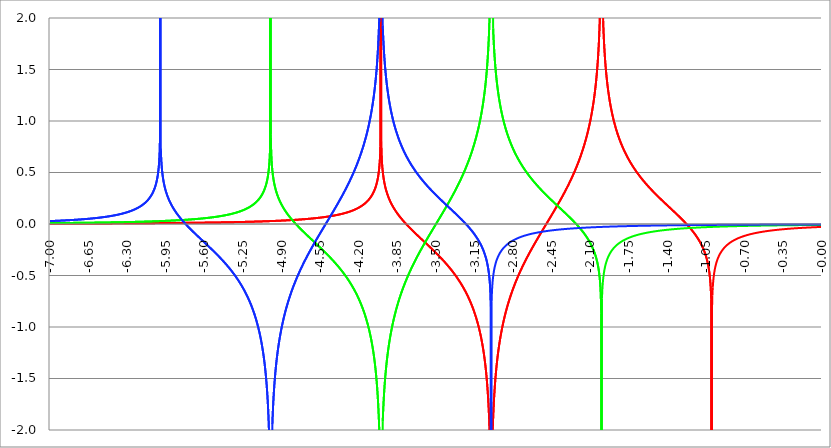
| Category | Series 1 | Series 0 | Series 2 |
|---|---|---|---|
| -7.0 | 0.004 | 0.009 | 0.028 |
| -6.9965 | 0.004 | 0.009 | 0.028 |
| -6.993 | 0.004 | 0.009 | 0.029 |
| -6.9895 | 0.004 | 0.009 | 0.029 |
| -6.986 | 0.004 | 0.009 | 0.029 |
| -6.982500000000001 | 0.004 | 0.009 | 0.029 |
| -6.979 | 0.004 | 0.009 | 0.029 |
| -6.975500000000001 | 0.004 | 0.009 | 0.029 |
| -6.972000000000001 | 0.004 | 0.009 | 0.03 |
| -6.968500000000001 | 0.004 | 0.009 | 0.03 |
| -6.965000000000002 | 0.004 | 0.009 | 0.03 |
| -6.961500000000002 | 0.004 | 0.009 | 0.03 |
| -6.958000000000002 | 0.004 | 0.009 | 0.03 |
| -6.954500000000002 | 0.004 | 0.009 | 0.03 |
| -6.951000000000002 | 0.004 | 0.009 | 0.03 |
| -6.947500000000002 | 0.004 | 0.009 | 0.031 |
| -6.944000000000003 | 0.004 | 0.009 | 0.031 |
| -6.940500000000003 | 0.004 | 0.009 | 0.031 |
| -6.937000000000003 | 0.004 | 0.009 | 0.031 |
| -6.933500000000003 | 0.004 | 0.009 | 0.031 |
| -6.930000000000003 | 0.004 | 0.009 | 0.031 |
| -6.926500000000003 | 0.004 | 0.01 | 0.032 |
| -6.923000000000004 | 0.004 | 0.01 | 0.032 |
| -6.919500000000004 | 0.004 | 0.01 | 0.032 |
| -6.916000000000004 | 0.004 | 0.01 | 0.032 |
| -6.912500000000004 | 0.004 | 0.01 | 0.032 |
| -6.909000000000004 | 0.004 | 0.01 | 0.033 |
| -6.905500000000004 | 0.004 | 0.01 | 0.033 |
| -6.902000000000004 | 0.004 | 0.01 | 0.033 |
| -6.898500000000005 | 0.004 | 0.01 | 0.033 |
| -6.895000000000005 | 0.004 | 0.01 | 0.033 |
| -6.891500000000005 | 0.004 | 0.01 | 0.033 |
| -6.888000000000005 | 0.004 | 0.01 | 0.034 |
| -6.884500000000005 | 0.004 | 0.01 | 0.034 |
| -6.881000000000005 | 0.004 | 0.01 | 0.034 |
| -6.877500000000006 | 0.004 | 0.01 | 0.034 |
| -6.874000000000006 | 0.004 | 0.01 | 0.034 |
| -6.870500000000006 | 0.004 | 0.01 | 0.035 |
| -6.867000000000006 | 0.004 | 0.01 | 0.035 |
| -6.863500000000006 | 0.004 | 0.01 | 0.035 |
| -6.860000000000006 | 0.004 | 0.01 | 0.035 |
| -6.856500000000007 | 0.004 | 0.01 | 0.035 |
| -6.853000000000007 | 0.004 | 0.01 | 0.036 |
| -6.849500000000007 | 0.004 | 0.01 | 0.036 |
| -6.846000000000007 | 0.004 | 0.01 | 0.036 |
| -6.842500000000007 | 0.004 | 0.01 | 0.036 |
| -6.839000000000007 | 0.004 | 0.01 | 0.036 |
| -6.835500000000008 | 0.004 | 0.01 | 0.037 |
| -6.832000000000008 | 0.004 | 0.01 | 0.037 |
| -6.828500000000008 | 0.004 | 0.01 | 0.037 |
| -6.825000000000008 | 0.004 | 0.011 | 0.037 |
| -6.821500000000008 | 0.004 | 0.011 | 0.037 |
| -6.818000000000008 | 0.005 | 0.011 | 0.038 |
| -6.814500000000009 | 0.005 | 0.011 | 0.038 |
| -6.811000000000009 | 0.005 | 0.011 | 0.038 |
| -6.807500000000009 | 0.005 | 0.011 | 0.038 |
| -6.804000000000009 | 0.005 | 0.011 | 0.039 |
| -6.800500000000009 | 0.005 | 0.011 | 0.039 |
| -6.797000000000009 | 0.005 | 0.011 | 0.039 |
| -6.79350000000001 | 0.005 | 0.011 | 0.039 |
| -6.79000000000001 | 0.005 | 0.011 | 0.039 |
| -6.78650000000001 | 0.005 | 0.011 | 0.04 |
| -6.78300000000001 | 0.005 | 0.011 | 0.04 |
| -6.77950000000001 | 0.005 | 0.011 | 0.04 |
| -6.77600000000001 | 0.005 | 0.011 | 0.04 |
| -6.772500000000011 | 0.005 | 0.011 | 0.041 |
| -6.769000000000011 | 0.005 | 0.011 | 0.041 |
| -6.765500000000011 | 0.005 | 0.011 | 0.041 |
| -6.762000000000011 | 0.005 | 0.011 | 0.041 |
| -6.758500000000011 | 0.005 | 0.011 | 0.042 |
| -6.755000000000011 | 0.005 | 0.011 | 0.042 |
| -6.751500000000012 | 0.005 | 0.011 | 0.042 |
| -6.748000000000012 | 0.005 | 0.011 | 0.042 |
| -6.744500000000012 | 0.005 | 0.011 | 0.043 |
| -6.741000000000012 | 0.005 | 0.011 | 0.043 |
| -6.737500000000012 | 0.005 | 0.011 | 0.043 |
| -6.734000000000012 | 0.005 | 0.012 | 0.043 |
| -6.730500000000013 | 0.005 | 0.012 | 0.044 |
| -6.727000000000013 | 0.005 | 0.012 | 0.044 |
| -6.723500000000013 | 0.005 | 0.012 | 0.044 |
| -6.720000000000013 | 0.005 | 0.012 | 0.045 |
| -6.716500000000013 | 0.005 | 0.012 | 0.045 |
| -6.713000000000013 | 0.005 | 0.012 | 0.045 |
| -6.709500000000013 | 0.005 | 0.012 | 0.045 |
| -6.706000000000014 | 0.005 | 0.012 | 0.046 |
| -6.702500000000014 | 0.005 | 0.012 | 0.046 |
| -6.699000000000014 | 0.005 | 0.012 | 0.046 |
| -6.695500000000014 | 0.005 | 0.012 | 0.047 |
| -6.692000000000014 | 0.005 | 0.012 | 0.047 |
| -6.688500000000014 | 0.005 | 0.012 | 0.047 |
| -6.685000000000015 | 0.005 | 0.012 | 0.047 |
| -6.681500000000015 | 0.005 | 0.012 | 0.048 |
| -6.678000000000015 | 0.005 | 0.012 | 0.048 |
| -6.674500000000015 | 0.005 | 0.012 | 0.048 |
| -6.671000000000015 | 0.005 | 0.012 | 0.049 |
| -6.667500000000015 | 0.005 | 0.012 | 0.049 |
| -6.664000000000016 | 0.005 | 0.012 | 0.049 |
| -6.660500000000016 | 0.005 | 0.012 | 0.05 |
| -6.657000000000016 | 0.005 | 0.013 | 0.05 |
| -6.653500000000016 | 0.005 | 0.013 | 0.05 |
| -6.650000000000016 | 0.005 | 0.013 | 0.051 |
| -6.646500000000016 | 0.005 | 0.013 | 0.051 |
| -6.643000000000017 | 0.005 | 0.013 | 0.051 |
| -6.639500000000017 | 0.005 | 0.013 | 0.052 |
| -6.636000000000017 | 0.005 | 0.013 | 0.052 |
| -6.632500000000017 | 0.005 | 0.013 | 0.052 |
| -6.629000000000017 | 0.005 | 0.013 | 0.053 |
| -6.625500000000017 | 0.005 | 0.013 | 0.053 |
| -6.622000000000018 | 0.005 | 0.013 | 0.054 |
| -6.618500000000018 | 0.005 | 0.013 | 0.054 |
| -6.615000000000018 | 0.005 | 0.013 | 0.054 |
| -6.611500000000018 | 0.005 | 0.013 | 0.055 |
| -6.608000000000018 | 0.005 | 0.013 | 0.055 |
| -6.604500000000018 | 0.005 | 0.013 | 0.055 |
| -6.601000000000019 | 0.005 | 0.013 | 0.056 |
| -6.597500000000019 | 0.005 | 0.013 | 0.056 |
| -6.594000000000019 | 0.005 | 0.013 | 0.057 |
| -6.590500000000019 | 0.005 | 0.013 | 0.057 |
| -6.587000000000019 | 0.005 | 0.013 | 0.057 |
| -6.583500000000019 | 0.005 | 0.014 | 0.058 |
| -6.58000000000002 | 0.005 | 0.014 | 0.058 |
| -6.57650000000002 | 0.005 | 0.014 | 0.059 |
| -6.57300000000002 | 0.005 | 0.014 | 0.059 |
| -6.56950000000002 | 0.005 | 0.014 | 0.059 |
| -6.56600000000002 | 0.005 | 0.014 | 0.06 |
| -6.56250000000002 | 0.005 | 0.014 | 0.06 |
| -6.55900000000002 | 0.005 | 0.014 | 0.061 |
| -6.555500000000021 | 0.006 | 0.014 | 0.061 |
| -6.552000000000021 | 0.006 | 0.014 | 0.062 |
| -6.548500000000021 | 0.006 | 0.014 | 0.062 |
| -6.545000000000021 | 0.006 | 0.014 | 0.063 |
| -6.541500000000021 | 0.006 | 0.014 | 0.063 |
| -6.538000000000021 | 0.006 | 0.014 | 0.063 |
| -6.534500000000022 | 0.006 | 0.014 | 0.064 |
| -6.531000000000021 | 0.006 | 0.014 | 0.064 |
| -6.527500000000022 | 0.006 | 0.014 | 0.065 |
| -6.524000000000022 | 0.006 | 0.014 | 0.065 |
| -6.520500000000022 | 0.006 | 0.015 | 0.066 |
| -6.517000000000023 | 0.006 | 0.015 | 0.066 |
| -6.513500000000023 | 0.006 | 0.015 | 0.067 |
| -6.510000000000023 | 0.006 | 0.015 | 0.067 |
| -6.506500000000023 | 0.006 | 0.015 | 0.068 |
| -6.503000000000023 | 0.006 | 0.015 | 0.068 |
| -6.499500000000023 | 0.006 | 0.015 | 0.069 |
| -6.496000000000023 | 0.006 | 0.015 | 0.07 |
| -6.492500000000024 | 0.006 | 0.015 | 0.07 |
| -6.489000000000023 | 0.006 | 0.015 | 0.071 |
| -6.485500000000024 | 0.006 | 0.015 | 0.071 |
| -6.482000000000024 | 0.006 | 0.015 | 0.072 |
| -6.478500000000024 | 0.006 | 0.015 | 0.072 |
| -6.475000000000024 | 0.006 | 0.015 | 0.073 |
| -6.471500000000024 | 0.006 | 0.015 | 0.073 |
| -6.468000000000024 | 0.006 | 0.015 | 0.074 |
| -6.464500000000025 | 0.006 | 0.015 | 0.075 |
| -6.461000000000025 | 0.006 | 0.016 | 0.075 |
| -6.457500000000025 | 0.006 | 0.016 | 0.076 |
| -6.454000000000025 | 0.006 | 0.016 | 0.076 |
| -6.450500000000025 | 0.006 | 0.016 | 0.077 |
| -6.447000000000025 | 0.006 | 0.016 | 0.078 |
| -6.443500000000025 | 0.006 | 0.016 | 0.078 |
| -6.440000000000026 | 0.006 | 0.016 | 0.079 |
| -6.436500000000026 | 0.006 | 0.016 | 0.08 |
| -6.433000000000026 | 0.006 | 0.016 | 0.08 |
| -6.429500000000026 | 0.006 | 0.016 | 0.081 |
| -6.426000000000026 | 0.006 | 0.016 | 0.082 |
| -6.422500000000027 | 0.006 | 0.016 | 0.082 |
| -6.419000000000027 | 0.006 | 0.016 | 0.083 |
| -6.415500000000027 | 0.006 | 0.016 | 0.084 |
| -6.412000000000027 | 0.006 | 0.016 | 0.085 |
| -6.408500000000027 | 0.006 | 0.017 | 0.085 |
| -6.405000000000027 | 0.006 | 0.017 | 0.086 |
| -6.401500000000027 | 0.006 | 0.017 | 0.087 |
| -6.398000000000028 | 0.006 | 0.017 | 0.088 |
| -6.394500000000028 | 0.006 | 0.017 | 0.088 |
| -6.391000000000028 | 0.006 | 0.017 | 0.089 |
| -6.387500000000029 | 0.006 | 0.017 | 0.09 |
| -6.384000000000029 | 0.006 | 0.017 | 0.091 |
| -6.380500000000029 | 0.006 | 0.017 | 0.092 |
| -6.37700000000003 | 0.006 | 0.017 | 0.092 |
| -6.37350000000003 | 0.006 | 0.017 | 0.093 |
| -6.37000000000003 | 0.006 | 0.017 | 0.094 |
| -6.36650000000003 | 0.006 | 0.017 | 0.095 |
| -6.36300000000003 | 0.006 | 0.017 | 0.096 |
| -6.35950000000003 | 0.006 | 0.018 | 0.097 |
| -6.35600000000003 | 0.006 | 0.018 | 0.098 |
| -6.35250000000003 | 0.006 | 0.018 | 0.099 |
| -6.34900000000003 | 0.007 | 0.018 | 0.1 |
| -6.345500000000031 | 0.007 | 0.018 | 0.101 |
| -6.342000000000031 | 0.007 | 0.018 | 0.101 |
| -6.338500000000031 | 0.007 | 0.018 | 0.102 |
| -6.335000000000031 | 0.007 | 0.018 | 0.103 |
| -6.331500000000031 | 0.007 | 0.018 | 0.104 |
| -6.328000000000031 | 0.007 | 0.018 | 0.106 |
| -6.324500000000031 | 0.007 | 0.018 | 0.107 |
| -6.321000000000032 | 0.007 | 0.018 | 0.108 |
| -6.317500000000032 | 0.007 | 0.018 | 0.109 |
| -6.314000000000032 | 0.007 | 0.019 | 0.11 |
| -6.310500000000032 | 0.007 | 0.019 | 0.111 |
| -6.307000000000032 | 0.007 | 0.019 | 0.112 |
| -6.303500000000032 | 0.007 | 0.019 | 0.113 |
| -6.300000000000033 | 0.007 | 0.019 | 0.114 |
| -6.296500000000033 | 0.007 | 0.019 | 0.116 |
| -6.293000000000033 | 0.007 | 0.019 | 0.117 |
| -6.289500000000033 | 0.007 | 0.019 | 0.118 |
| -6.286000000000033 | 0.007 | 0.019 | 0.119 |
| -6.282500000000033 | 0.007 | 0.019 | 0.121 |
| -6.279000000000033 | 0.007 | 0.019 | 0.122 |
| -6.275500000000034 | 0.007 | 0.019 | 0.123 |
| -6.272000000000034 | 0.007 | 0.02 | 0.125 |
| -6.268500000000034 | 0.007 | 0.02 | 0.126 |
| -6.265000000000034 | 0.007 | 0.02 | 0.127 |
| -6.261500000000034 | 0.007 | 0.02 | 0.129 |
| -6.258000000000034 | 0.007 | 0.02 | 0.13 |
| -6.254500000000035 | 0.007 | 0.02 | 0.132 |
| -6.251000000000034 | 0.007 | 0.02 | 0.133 |
| -6.247500000000035 | 0.007 | 0.02 | 0.135 |
| -6.244000000000035 | 0.007 | 0.02 | 0.136 |
| -6.240500000000035 | 0.007 | 0.02 | 0.138 |
| -6.237000000000035 | 0.007 | 0.02 | 0.14 |
| -6.233500000000035 | 0.007 | 0.021 | 0.141 |
| -6.230000000000035 | 0.007 | 0.021 | 0.143 |
| -6.226500000000036 | 0.007 | 0.021 | 0.145 |
| -6.223000000000036 | 0.007 | 0.021 | 0.146 |
| -6.219500000000036 | 0.007 | 0.021 | 0.148 |
| -6.216000000000036 | 0.007 | 0.021 | 0.15 |
| -6.212500000000037 | 0.007 | 0.021 | 0.152 |
| -6.209000000000036 | 0.007 | 0.021 | 0.154 |
| -6.205500000000037 | 0.007 | 0.021 | 0.156 |
| -6.202000000000037 | 0.007 | 0.021 | 0.158 |
| -6.198500000000037 | 0.007 | 0.021 | 0.16 |
| -6.195000000000038 | 0.007 | 0.022 | 0.162 |
| -6.191500000000038 | 0.007 | 0.022 | 0.164 |
| -6.188000000000038 | 0.007 | 0.022 | 0.166 |
| -6.184500000000038 | 0.008 | 0.022 | 0.169 |
| -6.181000000000038 | 0.008 | 0.022 | 0.171 |
| -6.177500000000038 | 0.008 | 0.022 | 0.173 |
| -6.174000000000039 | 0.008 | 0.022 | 0.176 |
| -6.170500000000039 | 0.008 | 0.022 | 0.178 |
| -6.167000000000039 | 0.008 | 0.022 | 0.181 |
| -6.163500000000039 | 0.008 | 0.023 | 0.184 |
| -6.160000000000039 | 0.008 | 0.023 | 0.186 |
| -6.156500000000039 | 0.008 | 0.023 | 0.189 |
| -6.15300000000004 | 0.008 | 0.023 | 0.192 |
| -6.14950000000004 | 0.008 | 0.023 | 0.195 |
| -6.14600000000004 | 0.008 | 0.023 | 0.198 |
| -6.14250000000004 | 0.008 | 0.023 | 0.201 |
| -6.13900000000004 | 0.008 | 0.023 | 0.204 |
| -6.13550000000004 | 0.008 | 0.023 | 0.208 |
| -6.132000000000041 | 0.008 | 0.023 | 0.211 |
| -6.128500000000041 | 0.008 | 0.024 | 0.215 |
| -6.125000000000041 | 0.008 | 0.024 | 0.218 |
| -6.121500000000041 | 0.008 | 0.024 | 0.222 |
| -6.118000000000041 | 0.008 | 0.024 | 0.226 |
| -6.114500000000041 | 0.008 | 0.024 | 0.23 |
| -6.111000000000042 | 0.008 | 0.024 | 0.235 |
| -6.107500000000042 | 0.008 | 0.024 | 0.239 |
| -6.104000000000042 | 0.008 | 0.024 | 0.244 |
| -6.100500000000042 | 0.008 | 0.025 | 0.248 |
| -6.097000000000042 | 0.008 | 0.025 | 0.253 |
| -6.093500000000042 | 0.008 | 0.025 | 0.258 |
| -6.090000000000042 | 0.008 | 0.025 | 0.264 |
| -6.086500000000043 | 0.008 | 0.025 | 0.27 |
| -6.083000000000043 | 0.008 | 0.025 | 0.275 |
| -6.079500000000043 | 0.008 | 0.025 | 0.282 |
| -6.076000000000043 | 0.008 | 0.025 | 0.288 |
| -6.072500000000043 | 0.008 | 0.026 | 0.295 |
| -6.069000000000043 | 0.008 | 0.026 | 0.302 |
| -6.065500000000044 | 0.008 | 0.026 | 0.31 |
| -6.062000000000044 | 0.008 | 0.026 | 0.318 |
| -6.058500000000044 | 0.008 | 0.026 | 0.327 |
| -6.055000000000044 | 0.008 | 0.026 | 0.336 |
| -6.051500000000044 | 0.008 | 0.026 | 0.346 |
| -6.048000000000044 | 0.008 | 0.026 | 0.357 |
| -6.044500000000045 | 0.009 | 0.027 | 0.368 |
| -6.041000000000044 | 0.009 | 0.027 | 0.381 |
| -6.037500000000045 | 0.009 | 0.027 | 0.395 |
| -6.034000000000045 | 0.009 | 0.027 | 0.41 |
| -6.030500000000045 | 0.009 | 0.027 | 0.427 |
| -6.027000000000045 | 0.009 | 0.027 | 0.447 |
| -6.023500000000046 | 0.009 | 0.027 | 0.469 |
| -6.020000000000046 | 0.009 | 0.028 | 0.495 |
| -6.016500000000046 | 0.009 | 0.028 | 0.526 |
| -6.013000000000046 | 0.009 | 0.028 | 0.564 |
| -6.009500000000046 | 0.009 | 0.028 | 0.615 |
| -6.006000000000046 | 0.009 | 0.028 | 0.691 |
| -6.002500000000047 | 0.009 | 0.028 | 0.836 |
| -5.999000000000046 | 0.009 | 0.028 | 10 |
| -5.995500000000047 | 0.009 | 0.029 | 0.736 |
| -5.992000000000047 | 0.009 | 0.029 | 0.639 |
| -5.988500000000047 | 0.009 | 0.029 | 0.577 |
| -5.985000000000047 | 0.009 | 0.029 | 0.532 |
| -5.981500000000047 | 0.009 | 0.029 | 0.496 |
| -5.978000000000047 | 0.009 | 0.029 | 0.466 |
| -5.974500000000048 | 0.009 | 0.029 | 0.44 |
| -5.971000000000048 | 0.009 | 0.03 | 0.418 |
| -5.967500000000048 | 0.009 | 0.03 | 0.397 |
| -5.964000000000048 | 0.009 | 0.03 | 0.379 |
| -5.960500000000049 | 0.009 | 0.03 | 0.363 |
| -5.957000000000049 | 0.009 | 0.03 | 0.347 |
| -5.953500000000049 | 0.009 | 0.03 | 0.333 |
| -5.950000000000049 | 0.009 | 0.031 | 0.32 |
| -5.94650000000005 | 0.009 | 0.031 | 0.308 |
| -5.94300000000005 | 0.009 | 0.031 | 0.296 |
| -5.93950000000005 | 0.009 | 0.031 | 0.285 |
| -5.93600000000005 | 0.009 | 0.031 | 0.274 |
| -5.93250000000005 | 0.009 | 0.031 | 0.264 |
| -5.92900000000005 | 0.009 | 0.032 | 0.255 |
| -5.92550000000005 | 0.01 | 0.032 | 0.245 |
| -5.92200000000005 | 0.01 | 0.032 | 0.237 |
| -5.91850000000005 | 0.01 | 0.032 | 0.228 |
| -5.915000000000051 | 0.01 | 0.032 | 0.22 |
| -5.911500000000051 | 0.01 | 0.032 | 0.212 |
| -5.908000000000051 | 0.01 | 0.033 | 0.204 |
| -5.904500000000051 | 0.01 | 0.033 | 0.197 |
| -5.901000000000051 | 0.01 | 0.033 | 0.19 |
| -5.897500000000051 | 0.01 | 0.033 | 0.183 |
| -5.894000000000052 | 0.01 | 0.033 | 0.176 |
| -5.890500000000052 | 0.01 | 0.033 | 0.169 |
| -5.887000000000052 | 0.01 | 0.034 | 0.163 |
| -5.883500000000052 | 0.01 | 0.034 | 0.156 |
| -5.880000000000052 | 0.01 | 0.034 | 0.15 |
| -5.876500000000052 | 0.01 | 0.034 | 0.144 |
| -5.873000000000053 | 0.01 | 0.034 | 0.138 |
| -5.869500000000053 | 0.01 | 0.035 | 0.132 |
| -5.866000000000053 | 0.01 | 0.035 | 0.127 |
| -5.862500000000053 | 0.01 | 0.035 | 0.121 |
| -5.859000000000053 | 0.01 | 0.035 | 0.116 |
| -5.855500000000053 | 0.01 | 0.035 | 0.11 |
| -5.852000000000054 | 0.01 | 0.036 | 0.105 |
| -5.848500000000054 | 0.01 | 0.036 | 0.1 |
| -5.845000000000054 | 0.01 | 0.036 | 0.095 |
| -5.841500000000054 | 0.01 | 0.036 | 0.089 |
| -5.838000000000054 | 0.01 | 0.036 | 0.085 |
| -5.834500000000054 | 0.01 | 0.037 | 0.08 |
| -5.831000000000054 | 0.01 | 0.037 | 0.075 |
| -5.827500000000055 | 0.01 | 0.037 | 0.07 |
| -5.824000000000055 | 0.011 | 0.037 | 0.065 |
| -5.820500000000055 | 0.011 | 0.037 | 0.061 |
| -5.817000000000055 | 0.011 | 0.038 | 0.056 |
| -5.813500000000055 | 0.011 | 0.038 | 0.051 |
| -5.810000000000056 | 0.011 | 0.038 | 0.047 |
| -5.806500000000056 | 0.011 | 0.038 | 0.043 |
| -5.803000000000056 | 0.011 | 0.039 | 0.038 |
| -5.799500000000056 | 0.011 | 0.039 | 0.034 |
| -5.796000000000056 | 0.011 | 0.039 | 0.029 |
| -5.792500000000056 | 0.011 | 0.039 | 0.025 |
| -5.789000000000056 | 0.011 | 0.04 | 0.021 |
| -5.785500000000057 | 0.011 | 0.04 | 0.017 |
| -5.782000000000057 | 0.011 | 0.04 | 0.013 |
| -5.778500000000057 | 0.011 | 0.04 | 0.008 |
| -5.775000000000057 | 0.011 | 0.04 | 0.004 |
| -5.771500000000057 | 0.011 | 0.041 | 0 |
| -5.768000000000057 | 0.011 | 0.041 | -0.004 |
| -5.764500000000058 | 0.011 | 0.041 | -0.008 |
| -5.761000000000058 | 0.011 | 0.041 | -0.012 |
| -5.757500000000058 | 0.011 | 0.042 | -0.016 |
| -5.754000000000058 | 0.011 | 0.042 | -0.02 |
| -5.750500000000058 | 0.011 | 0.042 | -0.023 |
| -5.747000000000058 | 0.011 | 0.042 | -0.027 |
| -5.743500000000059 | 0.011 | 0.043 | -0.031 |
| -5.740000000000059 | 0.011 | 0.043 | -0.035 |
| -5.736500000000059 | 0.012 | 0.043 | -0.039 |
| -5.73300000000006 | 0.012 | 0.044 | -0.043 |
| -5.729500000000059 | 0.012 | 0.044 | -0.046 |
| -5.726000000000059 | 0.012 | 0.044 | -0.05 |
| -5.72250000000006 | 0.012 | 0.044 | -0.054 |
| -5.71900000000006 | 0.012 | 0.045 | -0.058 |
| -5.71550000000006 | 0.012 | 0.045 | -0.061 |
| -5.71200000000006 | 0.012 | 0.045 | -0.065 |
| -5.70850000000006 | 0.012 | 0.045 | -0.069 |
| -5.70500000000006 | 0.012 | 0.046 | -0.072 |
| -5.70150000000006 | 0.012 | 0.046 | -0.076 |
| -5.698000000000061 | 0.012 | 0.046 | -0.08 |
| -5.694500000000061 | 0.012 | 0.047 | -0.083 |
| -5.691000000000061 | 0.012 | 0.047 | -0.087 |
| -5.687500000000061 | 0.012 | 0.047 | -0.09 |
| -5.684000000000061 | 0.012 | 0.048 | -0.094 |
| -5.680500000000062 | 0.012 | 0.048 | -0.098 |
| -5.677000000000062 | 0.012 | 0.048 | -0.101 |
| -5.673500000000062 | 0.012 | 0.048 | -0.105 |
| -5.670000000000062 | 0.012 | 0.049 | -0.108 |
| -5.666500000000062 | 0.012 | 0.049 | -0.112 |
| -5.663000000000062 | 0.012 | 0.049 | -0.115 |
| -5.659500000000062 | 0.012 | 0.05 | -0.119 |
| -5.656000000000063 | 0.013 | 0.05 | -0.122 |
| -5.652500000000063 | 0.013 | 0.05 | -0.126 |
| -5.649000000000063 | 0.013 | 0.051 | -0.129 |
| -5.645500000000063 | 0.013 | 0.051 | -0.133 |
| -5.642000000000063 | 0.013 | 0.051 | -0.136 |
| -5.638500000000063 | 0.013 | 0.052 | -0.14 |
| -5.635000000000064 | 0.013 | 0.052 | -0.143 |
| -5.631500000000064 | 0.013 | 0.053 | -0.147 |
| -5.628000000000064 | 0.013 | 0.053 | -0.15 |
| -5.624500000000064 | 0.013 | 0.053 | -0.154 |
| -5.621000000000064 | 0.013 | 0.054 | -0.157 |
| -5.617500000000064 | 0.013 | 0.054 | -0.161 |
| -5.614000000000065 | 0.013 | 0.054 | -0.164 |
| -5.610500000000065 | 0.013 | 0.055 | -0.168 |
| -5.607000000000065 | 0.013 | 0.055 | -0.171 |
| -5.603500000000065 | 0.013 | 0.055 | -0.175 |
| -5.600000000000065 | 0.013 | 0.056 | -0.178 |
| -5.596500000000065 | 0.013 | 0.056 | -0.182 |
| -5.593000000000065 | 0.013 | 0.057 | -0.185 |
| -5.589500000000065 | 0.013 | 0.057 | -0.189 |
| -5.586000000000066 | 0.014 | 0.057 | -0.192 |
| -5.582500000000066 | 0.014 | 0.058 | -0.196 |
| -5.579000000000066 | 0.014 | 0.058 | -0.2 |
| -5.575500000000066 | 0.014 | 0.059 | -0.203 |
| -5.572000000000066 | 0.014 | 0.059 | -0.207 |
| -5.568500000000067 | 0.014 | 0.06 | -0.21 |
| -5.565000000000067 | 0.014 | 0.06 | -0.214 |
| -5.561500000000067 | 0.014 | 0.06 | -0.217 |
| -5.558000000000067 | 0.014 | 0.061 | -0.221 |
| -5.554500000000067 | 0.014 | 0.061 | -0.224 |
| -5.551000000000067 | 0.014 | 0.062 | -0.228 |
| -5.547500000000068 | 0.014 | 0.062 | -0.232 |
| -5.544000000000068 | 0.014 | 0.063 | -0.235 |
| -5.540500000000068 | 0.014 | 0.063 | -0.239 |
| -5.537000000000068 | 0.014 | 0.064 | -0.242 |
| -5.533500000000068 | 0.014 | 0.064 | -0.246 |
| -5.530000000000068 | 0.014 | 0.065 | -0.25 |
| -5.526500000000069 | 0.014 | 0.065 | -0.253 |
| -5.523000000000069 | 0.014 | 0.066 | -0.257 |
| -5.51950000000007 | 0.015 | 0.066 | -0.26 |
| -5.51600000000007 | 0.015 | 0.067 | -0.264 |
| -5.512500000000069 | 0.015 | 0.067 | -0.268 |
| -5.50900000000007 | 0.015 | 0.068 | -0.272 |
| -5.50550000000007 | 0.015 | 0.068 | -0.275 |
| -5.50200000000007 | 0.015 | 0.069 | -0.279 |
| -5.49850000000007 | 0.015 | 0.069 | -0.283 |
| -5.49500000000007 | 0.015 | 0.07 | -0.286 |
| -5.49150000000007 | 0.015 | 0.07 | -0.29 |
| -5.48800000000007 | 0.015 | 0.071 | -0.294 |
| -5.484500000000071 | 0.015 | 0.071 | -0.298 |
| -5.48100000000007 | 0.015 | 0.072 | -0.302 |
| -5.477500000000071 | 0.015 | 0.072 | -0.305 |
| -5.474000000000071 | 0.015 | 0.073 | -0.309 |
| -5.470500000000071 | 0.015 | 0.074 | -0.313 |
| -5.467000000000072 | 0.015 | 0.074 | -0.317 |
| -5.463500000000072 | 0.016 | 0.075 | -0.321 |
| -5.460000000000072 | 0.016 | 0.075 | -0.325 |
| -5.456500000000072 | 0.016 | 0.076 | -0.329 |
| -5.453000000000072 | 0.016 | 0.077 | -0.333 |
| -5.449500000000072 | 0.016 | 0.077 | -0.337 |
| -5.446000000000072 | 0.016 | 0.078 | -0.341 |
| -5.442500000000073 | 0.016 | 0.079 | -0.345 |
| -5.439000000000072 | 0.016 | 0.079 | -0.349 |
| -5.435500000000073 | 0.016 | 0.08 | -0.353 |
| -5.432000000000073 | 0.016 | 0.081 | -0.357 |
| -5.428500000000073 | 0.016 | 0.081 | -0.361 |
| -5.425000000000074 | 0.016 | 0.082 | -0.365 |
| -5.421500000000074 | 0.016 | 0.083 | -0.369 |
| -5.418000000000074 | 0.016 | 0.083 | -0.373 |
| -5.414500000000074 | 0.016 | 0.084 | -0.378 |
| -5.411000000000074 | 0.016 | 0.085 | -0.382 |
| -5.407500000000074 | 0.017 | 0.086 | -0.386 |
| -5.404000000000074 | 0.017 | 0.086 | -0.39 |
| -5.400500000000074 | 0.017 | 0.087 | -0.395 |
| -5.397000000000075 | 0.017 | 0.088 | -0.399 |
| -5.393500000000075 | 0.017 | 0.089 | -0.403 |
| -5.390000000000075 | 0.017 | 0.089 | -0.408 |
| -5.386500000000075 | 0.017 | 0.09 | -0.412 |
| -5.383000000000075 | 0.017 | 0.091 | -0.417 |
| -5.379500000000075 | 0.017 | 0.092 | -0.421 |
| -5.376000000000075 | 0.017 | 0.093 | -0.426 |
| -5.372500000000076 | 0.017 | 0.094 | -0.43 |
| -5.369000000000076 | 0.017 | 0.094 | -0.435 |
| -5.365500000000076 | 0.017 | 0.095 | -0.44 |
| -5.362000000000076 | 0.017 | 0.096 | -0.444 |
| -5.358500000000077 | 0.018 | 0.097 | -0.449 |
| -5.355000000000077 | 0.018 | 0.098 | -0.454 |
| -5.351500000000077 | 0.018 | 0.099 | -0.459 |
| -5.348000000000077 | 0.018 | 0.1 | -0.464 |
| -5.344500000000077 | 0.018 | 0.101 | -0.468 |
| -5.341000000000077 | 0.018 | 0.102 | -0.473 |
| -5.337500000000078 | 0.018 | 0.103 | -0.478 |
| -5.334000000000078 | 0.018 | 0.104 | -0.483 |
| -5.330500000000078 | 0.018 | 0.105 | -0.488 |
| -5.327000000000078 | 0.018 | 0.106 | -0.494 |
| -5.323500000000078 | 0.018 | 0.107 | -0.499 |
| -5.320000000000078 | 0.018 | 0.108 | -0.504 |
| -5.316500000000079 | 0.018 | 0.109 | -0.509 |
| -5.313000000000079 | 0.019 | 0.11 | -0.515 |
| -5.309500000000079 | 0.019 | 0.111 | -0.52 |
| -5.30600000000008 | 0.019 | 0.112 | -0.525 |
| -5.302500000000079 | 0.019 | 0.114 | -0.531 |
| -5.29900000000008 | 0.019 | 0.115 | -0.536 |
| -5.29550000000008 | 0.019 | 0.116 | -0.542 |
| -5.29200000000008 | 0.019 | 0.117 | -0.548 |
| -5.28850000000008 | 0.019 | 0.118 | -0.554 |
| -5.28500000000008 | 0.019 | 0.12 | -0.559 |
| -5.28150000000008 | 0.019 | 0.121 | -0.565 |
| -5.27800000000008 | 0.019 | 0.122 | -0.571 |
| -5.274500000000081 | 0.019 | 0.124 | -0.577 |
| -5.27100000000008 | 0.02 | 0.125 | -0.583 |
| -5.267500000000081 | 0.02 | 0.126 | -0.59 |
| -5.264000000000081 | 0.02 | 0.128 | -0.596 |
| -5.260500000000081 | 0.02 | 0.129 | -0.602 |
| -5.257000000000081 | 0.02 | 0.131 | -0.609 |
| -5.253500000000082 | 0.02 | 0.132 | -0.615 |
| -5.250000000000082 | 0.02 | 0.134 | -0.622 |
| -5.246500000000082 | 0.02 | 0.135 | -0.628 |
| -5.243000000000082 | 0.02 | 0.137 | -0.635 |
| -5.239500000000082 | 0.02 | 0.138 | -0.642 |
| -5.236000000000082 | 0.02 | 0.14 | -0.649 |
| -5.232500000000083 | 0.021 | 0.142 | -0.656 |
| -5.229000000000083 | 0.021 | 0.143 | -0.663 |
| -5.225500000000083 | 0.021 | 0.145 | -0.67 |
| -5.222000000000083 | 0.021 | 0.147 | -0.678 |
| -5.218500000000083 | 0.021 | 0.149 | -0.685 |
| -5.215000000000083 | 0.021 | 0.151 | -0.693 |
| -5.211500000000083 | 0.021 | 0.152 | -0.701 |
| -5.208000000000084 | 0.021 | 0.154 | -0.709 |
| -5.204500000000084 | 0.021 | 0.156 | -0.717 |
| -5.201000000000084 | 0.021 | 0.158 | -0.725 |
| -5.197500000000084 | 0.022 | 0.161 | -0.733 |
| -5.194000000000084 | 0.022 | 0.163 | -0.742 |
| -5.190500000000084 | 0.022 | 0.165 | -0.75 |
| -5.187000000000085 | 0.022 | 0.167 | -0.759 |
| -5.183500000000085 | 0.022 | 0.169 | -0.768 |
| -5.180000000000085 | 0.022 | 0.172 | -0.777 |
| -5.176500000000085 | 0.022 | 0.174 | -0.787 |
| -5.173000000000085 | 0.022 | 0.177 | -0.796 |
| -5.169500000000085 | 0.022 | 0.179 | -0.806 |
| -5.166000000000086 | 0.022 | 0.182 | -0.816 |
| -5.162500000000086 | 0.023 | 0.184 | -0.826 |
| -5.159000000000086 | 0.023 | 0.187 | -0.836 |
| -5.155500000000086 | 0.023 | 0.19 | -0.847 |
| -5.152000000000086 | 0.023 | 0.193 | -0.857 |
| -5.148500000000086 | 0.023 | 0.196 | -0.869 |
| -5.145000000000087 | 0.023 | 0.199 | -0.88 |
| -5.141500000000087 | 0.023 | 0.202 | -0.892 |
| -5.138000000000087 | 0.023 | 0.205 | -0.903 |
| -5.134500000000087 | 0.023 | 0.209 | -0.916 |
| -5.131000000000087 | 0.024 | 0.212 | -0.928 |
| -5.127500000000087 | 0.024 | 0.216 | -0.941 |
| -5.124000000000088 | 0.024 | 0.22 | -0.955 |
| -5.120500000000088 | 0.024 | 0.223 | -0.968 |
| -5.117000000000088 | 0.024 | 0.227 | -0.982 |
| -5.113500000000088 | 0.024 | 0.232 | -0.997 |
| -5.110000000000088 | 0.024 | 0.236 | -1.012 |
| -5.106500000000088 | 0.024 | 0.24 | -1.027 |
| -5.103000000000089 | 0.024 | 0.245 | -1.044 |
| -5.099500000000089 | 0.025 | 0.25 | -1.06 |
| -5.096000000000089 | 0.025 | 0.255 | -1.077 |
| -5.092500000000089 | 0.025 | 0.26 | -1.095 |
| -5.08900000000009 | 0.025 | 0.265 | -1.114 |
| -5.085500000000089 | 0.025 | 0.271 | -1.133 |
| -5.08200000000009 | 0.025 | 0.277 | -1.153 |
| -5.07850000000009 | 0.025 | 0.283 | -1.175 |
| -5.07500000000009 | 0.025 | 0.29 | -1.197 |
| -5.07150000000009 | 0.026 | 0.297 | -1.22 |
| -5.06800000000009 | 0.026 | 0.304 | -1.244 |
| -5.06450000000009 | 0.026 | 0.312 | -1.27 |
| -5.061000000000091 | 0.026 | 0.321 | -1.297 |
| -5.057500000000091 | 0.026 | 0.329 | -1.326 |
| -5.054000000000091 | 0.026 | 0.339 | -1.356 |
| -5.050500000000091 | 0.026 | 0.349 | -1.389 |
| -5.047000000000091 | 0.026 | 0.36 | -1.424 |
| -5.043500000000091 | 0.027 | 0.372 | -1.462 |
| -5.040000000000092 | 0.027 | 0.385 | -1.503 |
| -5.036500000000092 | 0.027 | 0.399 | -1.548 |
| -5.033000000000092 | 0.027 | 0.415 | -1.598 |
| -5.029500000000092 | 0.027 | 0.433 | -1.653 |
| -5.026000000000092 | 0.027 | 0.453 | -1.716 |
| -5.022500000000092 | 0.027 | 0.476 | -1.787 |
| -5.019000000000092 | 0.028 | 0.503 | -1.871 |
| -5.015500000000093 | 0.028 | 0.536 | -1.972 |
| -5.012000000000093 | 0.028 | 0.577 | -2.099 |
| -5.008500000000093 | 0.028 | 0.634 | -2.27 |
| -5.005000000000093 | 0.028 | 0.721 | -2.535 |
| -5.001500000000093 | 0.028 | 10 | -10 |
| -4.998000000000093 | 0.028 | 0.872 | -2.991 |
| -4.994500000000094 | 0.029 | 0.702 | -2.485 |
| -4.991000000000094 | 0.029 | 0.619 | -2.237 |
| -4.987500000000094 | 0.029 | 0.563 | -2.072 |
| -4.984000000000094 | 0.029 | 0.521 | -1.948 |
| -4.980500000000094 | 0.029 | 0.487 | -1.848 |
| -4.977000000000094 | 0.029 | 0.458 | -1.765 |
| -4.973500000000094 | 0.029 | 0.433 | -1.693 |
| -4.970000000000094 | 0.03 | 0.412 | -1.63 |
| -4.966500000000095 | 0.03 | 0.392 | -1.574 |
| -4.963000000000095 | 0.03 | 0.374 | -1.523 |
| -4.959500000000095 | 0.03 | 0.358 | -1.477 |
| -4.956000000000095 | 0.03 | 0.343 | -1.435 |
| -4.952500000000096 | 0.03 | 0.329 | -1.395 |
| -4.949000000000095 | 0.031 | 0.316 | -1.359 |
| -4.945500000000096 | 0.031 | 0.304 | -1.325 |
| -4.942000000000096 | 0.031 | 0.293 | -1.293 |
| -4.938500000000096 | 0.031 | 0.282 | -1.262 |
| -4.935000000000096 | 0.031 | 0.271 | -1.234 |
| -4.931500000000096 | 0.031 | 0.261 | -1.206 |
| -4.928000000000097 | 0.032 | 0.252 | -1.18 |
| -4.924500000000097 | 0.032 | 0.243 | -1.156 |
| -4.921000000000097 | 0.032 | 0.234 | -1.132 |
| -4.917500000000097 | 0.032 | 0.226 | -1.109 |
| -4.914000000000097 | 0.032 | 0.218 | -1.087 |
| -4.910500000000098 | 0.032 | 0.21 | -1.066 |
| -4.907000000000098 | 0.033 | 0.202 | -1.046 |
| -4.903500000000098 | 0.033 | 0.195 | -1.026 |
| -4.900000000000098 | 0.033 | 0.188 | -1.008 |
| -4.896500000000098 | 0.033 | 0.181 | -0.989 |
| -4.893000000000098 | 0.033 | 0.174 | -0.971 |
| -4.889500000000098 | 0.034 | 0.167 | -0.954 |
| -4.886000000000099 | 0.034 | 0.161 | -0.938 |
| -4.882500000000099 | 0.034 | 0.155 | -0.921 |
| -4.879000000000099 | 0.034 | 0.148 | -0.905 |
| -4.875500000000099 | 0.034 | 0.142 | -0.89 |
| -4.872000000000099 | 0.034 | 0.136 | -0.875 |
| -4.868500000000099 | 0.035 | 0.131 | -0.86 |
| -4.8650000000001 | 0.035 | 0.125 | -0.846 |
| -4.8615000000001 | 0.035 | 0.119 | -0.832 |
| -4.8580000000001 | 0.035 | 0.114 | -0.818 |
| -4.8545000000001 | 0.035 | 0.109 | -0.805 |
| -4.8510000000001 | 0.036 | 0.103 | -0.792 |
| -4.8475000000001 | 0.036 | 0.098 | -0.779 |
| -4.844000000000101 | 0.036 | 0.093 | -0.766 |
| -4.840500000000101 | 0.036 | 0.088 | -0.754 |
| -4.837000000000101 | 0.036 | 0.083 | -0.742 |
| -4.833500000000101 | 0.037 | 0.078 | -0.73 |
| -4.830000000000101 | 0.037 | 0.073 | -0.718 |
| -4.826500000000101 | 0.037 | 0.069 | -0.707 |
| -4.823000000000102 | 0.037 | 0.064 | -0.695 |
| -4.819500000000102 | 0.038 | 0.059 | -0.684 |
| -4.816000000000102 | 0.038 | 0.055 | -0.673 |
| -4.812500000000102 | 0.038 | 0.05 | -0.663 |
| -4.809000000000102 | 0.038 | 0.046 | -0.652 |
| -4.805500000000102 | 0.038 | 0.041 | -0.642 |
| -4.802000000000103 | 0.039 | 0.037 | -0.631 |
| -4.798500000000103 | 0.039 | 0.033 | -0.621 |
| -4.795000000000103 | 0.039 | 0.028 | -0.611 |
| -4.791500000000103 | 0.039 | 0.024 | -0.601 |
| -4.788000000000103 | 0.04 | 0.02 | -0.592 |
| -4.784500000000103 | 0.04 | 0.016 | -0.582 |
| -4.781000000000103 | 0.04 | 0.011 | -0.573 |
| -4.777500000000104 | 0.04 | 0.007 | -0.563 |
| -4.774000000000104 | 0.041 | 0.003 | -0.554 |
| -4.770500000000104 | 0.041 | -0.001 | -0.545 |
| -4.767000000000104 | 0.041 | -0.005 | -0.536 |
| -4.763500000000104 | 0.041 | -0.009 | -0.527 |
| -4.760000000000104 | 0.042 | -0.013 | -0.518 |
| -4.756500000000104 | 0.042 | -0.017 | -0.509 |
| -4.753000000000104 | 0.042 | -0.021 | -0.501 |
| -4.749500000000105 | 0.042 | -0.025 | -0.492 |
| -4.746000000000105 | 0.043 | -0.028 | -0.484 |
| -4.742500000000105 | 0.043 | -0.032 | -0.475 |
| -4.739000000000105 | 0.043 | -0.036 | -0.467 |
| -4.735500000000105 | 0.043 | -0.04 | -0.459 |
| -4.732000000000105 | 0.044 | -0.044 | -0.45 |
| -4.728500000000106 | 0.044 | -0.047 | -0.442 |
| -4.725000000000106 | 0.044 | -0.051 | -0.434 |
| -4.721500000000106 | 0.044 | -0.055 | -0.426 |
| -4.718000000000106 | 0.045 | -0.059 | -0.418 |
| -4.714500000000107 | 0.045 | -0.062 | -0.411 |
| -4.711000000000106 | 0.045 | -0.066 | -0.403 |
| -4.707500000000107 | 0.046 | -0.07 | -0.395 |
| -4.704000000000107 | 0.046 | -0.073 | -0.388 |
| -4.700500000000107 | 0.046 | -0.077 | -0.38 |
| -4.697000000000107 | 0.046 | -0.081 | -0.372 |
| -4.693500000000108 | 0.047 | -0.084 | -0.365 |
| -4.690000000000108 | 0.047 | -0.088 | -0.358 |
| -4.686500000000108 | 0.047 | -0.091 | -0.35 |
| -4.683000000000108 | 0.048 | -0.095 | -0.343 |
| -4.679500000000108 | 0.048 | -0.099 | -0.336 |
| -4.676000000000108 | 0.048 | -0.102 | -0.328 |
| -4.672500000000109 | 0.049 | -0.106 | -0.321 |
| -4.669000000000109 | 0.049 | -0.109 | -0.314 |
| -4.665500000000109 | 0.049 | -0.113 | -0.307 |
| -4.662000000000109 | 0.05 | -0.116 | -0.3 |
| -4.658500000000109 | 0.05 | -0.12 | -0.293 |
| -4.655000000000109 | 0.05 | -0.123 | -0.286 |
| -4.65150000000011 | 0.051 | -0.127 | -0.279 |
| -4.64800000000011 | 0.051 | -0.13 | -0.272 |
| -4.64450000000011 | 0.051 | -0.134 | -0.265 |
| -4.64100000000011 | 0.052 | -0.137 | -0.258 |
| -4.63750000000011 | 0.052 | -0.141 | -0.252 |
| -4.63400000000011 | 0.052 | -0.144 | -0.245 |
| -4.630500000000111 | 0.053 | -0.148 | -0.238 |
| -4.627000000000111 | 0.053 | -0.151 | -0.231 |
| -4.623500000000111 | 0.053 | -0.155 | -0.225 |
| -4.620000000000111 | 0.054 | -0.158 | -0.218 |
| -4.616500000000111 | 0.054 | -0.162 | -0.211 |
| -4.613000000000111 | 0.054 | -0.165 | -0.205 |
| -4.609500000000112 | 0.055 | -0.169 | -0.198 |
| -4.606000000000112 | 0.055 | -0.172 | -0.192 |
| -4.602500000000112 | 0.056 | -0.176 | -0.185 |
| -4.599000000000112 | 0.056 | -0.179 | -0.179 |
| -4.595500000000112 | 0.056 | -0.183 | -0.172 |
| -4.592000000000112 | 0.057 | -0.186 | -0.166 |
| -4.588500000000113 | 0.057 | -0.19 | -0.159 |
| -4.585000000000113 | 0.058 | -0.193 | -0.153 |
| -4.581500000000113 | 0.058 | -0.197 | -0.146 |
| -4.578000000000113 | 0.058 | -0.201 | -0.14 |
| -4.574500000000113 | 0.059 | -0.204 | -0.134 |
| -4.571000000000113 | 0.059 | -0.208 | -0.127 |
| -4.567500000000114 | 0.06 | -0.211 | -0.121 |
| -4.564000000000114 | 0.06 | -0.215 | -0.114 |
| -4.560500000000114 | 0.061 | -0.218 | -0.108 |
| -4.557000000000114 | 0.061 | -0.222 | -0.102 |
| -4.553500000000114 | 0.061 | -0.225 | -0.096 |
| -4.550000000000114 | 0.062 | -0.229 | -0.089 |
| -4.546500000000114 | 0.062 | -0.233 | -0.083 |
| -4.543000000000114 | 0.063 | -0.236 | -0.077 |
| -4.539500000000114 | 0.063 | -0.24 | -0.07 |
| -4.536000000000115 | 0.064 | -0.243 | -0.064 |
| -4.532500000000115 | 0.064 | -0.247 | -0.058 |
| -4.529000000000115 | 0.065 | -0.251 | -0.052 |
| -4.525500000000116 | 0.065 | -0.254 | -0.045 |
| -4.522000000000116 | 0.066 | -0.258 | -0.039 |
| -4.518500000000116 | 0.066 | -0.262 | -0.033 |
| -4.515000000000116 | 0.067 | -0.265 | -0.027 |
| -4.511500000000116 | 0.067 | -0.269 | -0.02 |
| -4.508000000000116 | 0.068 | -0.273 | -0.014 |
| -4.504500000000117 | 0.068 | -0.276 | -0.008 |
| -4.501000000000116 | 0.069 | -0.28 | -0.002 |
| -4.497500000000117 | 0.069 | -0.284 | 0.004 |
| -4.494000000000117 | 0.07 | -0.287 | 0.011 |
| -4.490500000000117 | 0.07 | -0.291 | 0.017 |
| -4.487000000000117 | 0.071 | -0.295 | 0.023 |
| -4.483500000000117 | 0.071 | -0.299 | 0.029 |
| -4.480000000000117 | 0.072 | -0.303 | 0.036 |
| -4.476500000000117 | 0.073 | -0.306 | 0.042 |
| -4.473000000000117 | 0.073 | -0.31 | 0.048 |
| -4.469500000000118 | 0.074 | -0.314 | 0.054 |
| -4.466000000000118 | 0.074 | -0.318 | 0.061 |
| -4.462500000000118 | 0.075 | -0.322 | 0.067 |
| -4.459000000000118 | 0.076 | -0.326 | 0.073 |
| -4.455500000000119 | 0.076 | -0.33 | 0.079 |
| -4.452000000000119 | 0.077 | -0.334 | 0.086 |
| -4.44850000000012 | 0.077 | -0.338 | 0.092 |
| -4.44500000000012 | 0.078 | -0.342 | 0.098 |
| -4.44150000000012 | 0.079 | -0.346 | 0.105 |
| -4.43800000000012 | 0.079 | -0.35 | 0.111 |
| -4.43450000000012 | 0.08 | -0.354 | 0.117 |
| -4.43100000000012 | 0.081 | -0.358 | 0.124 |
| -4.42750000000012 | 0.081 | -0.362 | 0.13 |
| -4.42400000000012 | 0.082 | -0.366 | 0.136 |
| -4.42050000000012 | 0.083 | -0.37 | 0.143 |
| -4.41700000000012 | 0.084 | -0.375 | 0.149 |
| -4.41350000000012 | 0.084 | -0.379 | 0.156 |
| -4.41000000000012 | 0.085 | -0.383 | 0.162 |
| -4.40650000000012 | 0.086 | -0.387 | 0.168 |
| -4.40300000000012 | 0.087 | -0.392 | 0.175 |
| -4.399500000000121 | 0.087 | -0.396 | 0.181 |
| -4.396000000000121 | 0.088 | -0.4 | 0.188 |
| -4.392500000000122 | 0.089 | -0.405 | 0.194 |
| -4.389000000000121 | 0.09 | -0.409 | 0.201 |
| -4.385500000000122 | 0.09 | -0.414 | 0.208 |
| -4.382000000000122 | 0.091 | -0.418 | 0.214 |
| -4.378500000000122 | 0.092 | -0.423 | 0.221 |
| -4.375000000000122 | 0.093 | -0.427 | 0.228 |
| -4.371500000000122 | 0.094 | -0.432 | 0.234 |
| -4.368000000000123 | 0.095 | -0.436 | 0.241 |
| -4.364500000000123 | 0.096 | -0.441 | 0.248 |
| -4.361000000000123 | 0.096 | -0.446 | 0.255 |
| -4.357500000000123 | 0.097 | -0.45 | 0.261 |
| -4.354000000000123 | 0.098 | -0.455 | 0.268 |
| -4.350500000000124 | 0.099 | -0.46 | 0.275 |
| -4.347000000000124 | 0.1 | -0.465 | 0.282 |
| -4.343500000000124 | 0.101 | -0.47 | 0.289 |
| -4.340000000000124 | 0.102 | -0.475 | 0.296 |
| -4.336500000000124 | 0.103 | -0.48 | 0.303 |
| -4.333000000000124 | 0.104 | -0.485 | 0.31 |
| -4.329500000000124 | 0.105 | -0.49 | 0.317 |
| -4.326000000000124 | 0.106 | -0.495 | 0.324 |
| -4.322500000000125 | 0.107 | -0.5 | 0.332 |
| -4.319000000000125 | 0.108 | -0.505 | 0.339 |
| -4.315500000000125 | 0.109 | -0.511 | 0.346 |
| -4.312000000000125 | 0.11 | -0.516 | 0.353 |
| -4.308500000000125 | 0.112 | -0.522 | 0.361 |
| -4.305000000000125 | 0.113 | -0.527 | 0.368 |
| -4.301500000000125 | 0.114 | -0.533 | 0.376 |
| -4.298000000000126 | 0.115 | -0.538 | 0.383 |
| -4.294500000000126 | 0.116 | -0.544 | 0.391 |
| -4.291000000000126 | 0.117 | -0.549 | 0.399 |
| -4.287500000000126 | 0.119 | -0.555 | 0.406 |
| -4.284000000000126 | 0.12 | -0.561 | 0.414 |
| -4.280500000000126 | 0.121 | -0.567 | 0.422 |
| -4.277000000000127 | 0.123 | -0.573 | 0.43 |
| -4.273500000000127 | 0.124 | -0.579 | 0.438 |
| -4.270000000000127 | 0.125 | -0.585 | 0.446 |
| -4.266500000000127 | 0.127 | -0.591 | 0.454 |
| -4.263000000000127 | 0.128 | -0.598 | 0.462 |
| -4.259500000000127 | 0.13 | -0.604 | 0.47 |
| -4.256000000000128 | 0.131 | -0.61 | 0.479 |
| -4.252500000000128 | 0.133 | -0.617 | 0.487 |
| -4.249000000000128 | 0.134 | -0.624 | 0.496 |
| -4.245500000000128 | 0.136 | -0.63 | 0.504 |
| -4.242000000000128 | 0.137 | -0.637 | 0.513 |
| -4.238500000000128 | 0.139 | -0.644 | 0.522 |
| -4.23500000000013 | 0.14 | -0.651 | 0.531 |
| -4.23150000000013 | 0.142 | -0.658 | 0.54 |
| -4.22800000000013 | 0.144 | -0.665 | 0.549 |
| -4.22450000000013 | 0.146 | -0.673 | 0.558 |
| -4.22100000000013 | 0.147 | -0.68 | 0.567 |
| -4.21750000000013 | 0.149 | -0.688 | 0.577 |
| -4.21400000000013 | 0.151 | -0.695 | 0.586 |
| -4.21050000000013 | 0.153 | -0.703 | 0.596 |
| -4.20700000000013 | 0.155 | -0.711 | 0.606 |
| -4.20350000000013 | 0.157 | -0.719 | 0.616 |
| -4.20000000000013 | 0.159 | -0.727 | 0.626 |
| -4.196500000000131 | 0.161 | -0.736 | 0.636 |
| -4.193000000000131 | 0.163 | -0.744 | 0.646 |
| -4.189500000000131 | 0.165 | -0.753 | 0.657 |
| -4.186000000000131 | 0.168 | -0.762 | 0.667 |
| -4.182500000000132 | 0.17 | -0.771 | 0.678 |
| -4.179000000000131 | 0.172 | -0.78 | 0.689 |
| -4.175500000000132 | 0.175 | -0.789 | 0.7 |
| -4.172000000000132 | 0.177 | -0.799 | 0.712 |
| -4.168500000000132 | 0.18 | -0.809 | 0.723 |
| -4.165000000000132 | 0.182 | -0.818 | 0.735 |
| -4.161500000000133 | 0.185 | -0.829 | 0.747 |
| -4.158000000000133 | 0.188 | -0.839 | 0.759 |
| -4.154500000000133 | 0.191 | -0.85 | 0.772 |
| -4.151000000000133 | 0.194 | -0.861 | 0.784 |
| -4.147500000000133 | 0.197 | -0.872 | 0.797 |
| -4.144000000000133 | 0.2 | -0.883 | 0.811 |
| -4.140500000000134 | 0.203 | -0.895 | 0.824 |
| -4.137000000000134 | 0.206 | -0.907 | 0.838 |
| -4.133500000000134 | 0.21 | -0.919 | 0.852 |
| -4.130000000000134 | 0.213 | -0.932 | 0.867 |
| -4.126500000000134 | 0.217 | -0.945 | 0.881 |
| -4.123000000000134 | 0.221 | -0.958 | 0.897 |
| -4.119500000000134 | 0.225 | -0.972 | 0.912 |
| -4.116000000000134 | 0.229 | -0.986 | 0.928 |
| -4.112500000000135 | 0.233 | -1.001 | 0.945 |
| -4.109000000000134 | 0.237 | -1.016 | 0.962 |
| -4.105500000000135 | 0.242 | -1.032 | 0.979 |
| -4.102000000000135 | 0.246 | -1.048 | 0.997 |
| -4.098500000000135 | 0.251 | -1.065 | 1.016 |
| -4.095000000000135 | 0.256 | -1.082 | 1.035 |
| -4.091500000000135 | 0.262 | -1.101 | 1.055 |
| -4.088000000000135 | 0.267 | -1.119 | 1.075 |
| -4.084500000000136 | 0.273 | -1.139 | 1.097 |
| -4.081000000000136 | 0.279 | -1.159 | 1.119 |
| -4.077500000000136 | 0.285 | -1.181 | 1.142 |
| -4.074000000000136 | 0.292 | -1.203 | 1.166 |
| -4.070500000000136 | 0.299 | -1.227 | 1.191 |
| -4.067000000000137 | 0.307 | -1.251 | 1.218 |
| -4.063500000000137 | 0.315 | -1.277 | 1.246 |
| -4.060000000000137 | 0.323 | -1.305 | 1.275 |
| -4.056500000000137 | 0.332 | -1.334 | 1.306 |
| -4.053000000000137 | 0.342 | -1.366 | 1.339 |
| -4.049500000000137 | 0.352 | -1.399 | 1.374 |
| -4.046000000000137 | 0.363 | -1.435 | 1.412 |
| -4.042500000000138 | 0.376 | -1.474 | 1.452 |
| -4.039000000000138 | 0.389 | -1.516 | 1.496 |
| -4.035500000000138 | 0.404 | -1.562 | 1.544 |
| -4.032000000000138 | 0.42 | -1.613 | 1.597 |
| -4.028500000000139 | 0.438 | -1.67 | 1.656 |
| -4.025000000000139 | 0.459 | -1.735 | 1.722 |
| -4.02150000000014 | 0.483 | -1.81 | 1.799 |
| -4.01800000000014 | 0.512 | -1.898 | 1.889 |
| -4.014500000000139 | 0.547 | -2.005 | 1.998 |
| -4.01100000000014 | 0.592 | -2.142 | 2.137 |
| -4.00750000000014 | 0.654 | -2.333 | 2.329 |
| -4.00400000000014 | 0.758 | -2.646 | 2.644 |
| -4.00050000000014 | 10 | -10 | 10 |
| -3.99700000000014 | 0.804 | -2.788 | 2.79 |
| -3.99350000000014 | 0.674 | -2.401 | 2.404 |
| -3.99000000000014 | 0.601 | -2.185 | 2.19 |
| -3.986500000000141 | 0.55 | -2.034 | 2.04 |
| -3.983000000000141 | 0.51 | -1.917 | 1.926 |
| -3.979500000000141 | 0.478 | -1.823 | 1.833 |
| -3.976000000000141 | 0.451 | -1.743 | 1.755 |
| -3.972500000000141 | 0.427 | -1.674 | 1.688 |
| -3.969000000000141 | 0.406 | -1.613 | 1.629 |
| -3.965500000000142 | 0.387 | -1.559 | 1.576 |
| -3.962000000000142 | 0.37 | -1.51 | 1.529 |
| -3.958500000000142 | 0.354 | -1.465 | 1.485 |
| -3.955000000000142 | 0.339 | -1.423 | 1.446 |
| -3.951500000000142 | 0.326 | -1.385 | 1.409 |
| -3.948000000000142 | 0.313 | -1.349 | 1.375 |
| -3.944500000000143 | 0.301 | -1.315 | 1.343 |
| -3.941000000000143 | 0.289 | -1.284 | 1.313 |
| -3.937500000000143 | 0.279 | -1.254 | 1.285 |
| -3.934000000000143 | 0.268 | -1.226 | 1.259 |
| -3.930500000000143 | 0.259 | -1.199 | 1.234 |
| -3.927000000000143 | 0.249 | -1.173 | 1.21 |
| -3.923500000000144 | 0.24 | -1.149 | 1.187 |
| -3.920000000000144 | 0.232 | -1.125 | 1.165 |
| -3.916500000000144 | 0.223 | -1.103 | 1.145 |
| -3.913000000000144 | 0.215 | -1.081 | 1.125 |
| -3.909500000000144 | 0.208 | -1.06 | 1.106 |
| -3.906000000000144 | 0.2 | -1.04 | 1.088 |
| -3.902500000000145 | 0.193 | -1.021 | 1.07 |
| -3.899000000000145 | 0.186 | -1.002 | 1.053 |
| -3.895500000000145 | 0.179 | -0.984 | 1.037 |
| -3.892000000000145 | 0.172 | -0.966 | 1.021 |
| -3.888500000000145 | 0.165 | -0.949 | 1.005 |
| -3.885000000000145 | 0.159 | -0.933 | 0.991 |
| -3.881500000000146 | 0.153 | -0.917 | 0.976 |
| -3.878000000000146 | 0.147 | -0.901 | 0.962 |
| -3.874500000000146 | 0.141 | -0.886 | 0.949 |
| -3.871000000000146 | 0.135 | -0.871 | 0.936 |
| -3.867500000000146 | 0.129 | -0.856 | 0.923 |
| -3.864000000000146 | 0.123 | -0.842 | 0.91 |
| -3.860500000000147 | 0.118 | -0.828 | 0.898 |
| -3.857000000000147 | 0.112 | -0.814 | 0.887 |
| -3.853500000000147 | 0.107 | -0.801 | 0.875 |
| -3.850000000000147 | 0.102 | -0.788 | 0.864 |
| -3.846500000000147 | 0.097 | -0.775 | 0.853 |
| -3.843000000000147 | 0.092 | -0.763 | 0.842 |
| -3.839500000000148 | 0.087 | -0.75 | 0.832 |
| -3.836000000000148 | 0.082 | -0.738 | 0.821 |
| -3.832500000000148 | 0.077 | -0.727 | 0.811 |
| -3.829000000000148 | 0.072 | -0.715 | 0.802 |
| -3.825500000000148 | 0.067 | -0.704 | 0.792 |
| -3.822000000000148 | 0.063 | -0.692 | 0.782 |
| -3.818500000000149 | 0.058 | -0.681 | 0.773 |
| -3.815000000000149 | 0.053 | -0.67 | 0.764 |
| -3.811500000000149 | 0.049 | -0.66 | 0.755 |
| -3.808000000000149 | 0.044 | -0.649 | 0.747 |
| -3.804500000000149 | 0.04 | -0.639 | 0.738 |
| -3.801000000000149 | 0.036 | -0.628 | 0.73 |
| -3.797500000000149 | 0.031 | -0.618 | 0.721 |
| -3.79400000000015 | 0.027 | -0.608 | 0.713 |
| -3.79050000000015 | 0.023 | -0.599 | 0.705 |
| -3.78700000000015 | 0.019 | -0.589 | 0.697 |
| -3.78350000000015 | 0.014 | -0.579 | 0.69 |
| -3.78000000000015 | 0.01 | -0.57 | 0.682 |
| -3.77650000000015 | 0.006 | -0.561 | 0.675 |
| -3.773000000000151 | 0.002 | -0.551 | 0.667 |
| -3.769500000000151 | -0.002 | -0.542 | 0.66 |
| -3.766000000000151 | -0.006 | -0.533 | 0.653 |
| -3.762500000000151 | -0.01 | -0.524 | 0.646 |
| -3.759000000000151 | -0.014 | -0.515 | 0.639 |
| -3.755500000000151 | -0.018 | -0.507 | 0.632 |
| -3.752000000000152 | -0.022 | -0.498 | 0.625 |
| -3.748500000000152 | -0.026 | -0.49 | 0.619 |
| -3.745000000000152 | -0.03 | -0.481 | 0.612 |
| -3.741500000000152 | -0.033 | -0.473 | 0.606 |
| -3.738000000000152 | -0.037 | -0.464 | 0.599 |
| -3.734500000000152 | -0.041 | -0.456 | 0.593 |
| -3.731000000000153 | -0.045 | -0.448 | 0.587 |
| -3.727500000000152 | -0.048 | -0.44 | 0.581 |
| -3.724000000000153 | -0.052 | -0.432 | 0.575 |
| -3.720500000000153 | -0.056 | -0.424 | 0.569 |
| -3.717000000000153 | -0.06 | -0.416 | 0.563 |
| -3.713500000000153 | -0.063 | -0.408 | 0.557 |
| -3.710000000000154 | -0.067 | -0.401 | 0.551 |
| -3.706500000000154 | -0.071 | -0.393 | 0.545 |
| -3.703000000000154 | -0.074 | -0.385 | 0.54 |
| -3.699500000000154 | -0.078 | -0.378 | 0.534 |
| -3.696000000000154 | -0.082 | -0.37 | 0.529 |
| -3.692500000000154 | -0.085 | -0.363 | 0.523 |
| -3.689000000000154 | -0.089 | -0.355 | 0.518 |
| -3.685500000000155 | -0.092 | -0.348 | 0.512 |
| -3.682000000000155 | -0.096 | -0.341 | 0.507 |
| -3.678500000000155 | -0.1 | -0.334 | 0.502 |
| -3.675000000000155 | -0.103 | -0.326 | 0.497 |
| -3.671500000000155 | -0.107 | -0.319 | 0.491 |
| -3.668000000000155 | -0.11 | -0.312 | 0.486 |
| -3.664500000000156 | -0.114 | -0.305 | 0.481 |
| -3.661000000000156 | -0.117 | -0.298 | 0.476 |
| -3.657500000000156 | -0.121 | -0.291 | 0.471 |
| -3.654000000000156 | -0.124 | -0.284 | 0.466 |
| -3.650500000000156 | -0.128 | -0.277 | 0.461 |
| -3.647000000000156 | -0.131 | -0.27 | 0.457 |
| -3.643500000000156 | -0.135 | -0.263 | 0.452 |
| -3.640000000000157 | -0.138 | -0.256 | 0.447 |
| -3.636500000000157 | -0.142 | -0.25 | 0.442 |
| -3.633000000000157 | -0.145 | -0.243 | 0.438 |
| -3.629500000000157 | -0.149 | -0.236 | 0.433 |
| -3.626000000000157 | -0.152 | -0.229 | 0.428 |
| -3.622500000000158 | -0.156 | -0.223 | 0.424 |
| -3.619000000000158 | -0.159 | -0.216 | 0.419 |
| -3.615500000000158 | -0.163 | -0.21 | 0.415 |
| -3.612000000000158 | -0.166 | -0.203 | 0.41 |
| -3.608500000000158 | -0.17 | -0.196 | 0.406 |
| -3.605000000000158 | -0.173 | -0.19 | 0.402 |
| -3.601500000000159 | -0.177 | -0.183 | 0.397 |
| -3.598000000000159 | -0.18 | -0.177 | 0.393 |
| -3.594500000000159 | -0.184 | -0.17 | 0.389 |
| -3.591000000000159 | -0.187 | -0.164 | 0.384 |
| -3.58750000000016 | -0.191 | -0.157 | 0.38 |
| -3.584000000000159 | -0.195 | -0.151 | 0.376 |
| -3.58050000000016 | -0.198 | -0.145 | 0.372 |
| -3.57700000000016 | -0.202 | -0.138 | 0.367 |
| -3.57350000000016 | -0.205 | -0.132 | 0.363 |
| -3.57000000000016 | -0.209 | -0.125 | 0.359 |
| -3.56650000000016 | -0.212 | -0.119 | 0.355 |
| -3.56300000000016 | -0.216 | -0.113 | 0.351 |
| -3.559500000000161 | -0.219 | -0.106 | 0.347 |
| -3.556000000000161 | -0.223 | -0.1 | 0.343 |
| -3.552500000000161 | -0.226 | -0.094 | 0.339 |
| -3.549000000000161 | -0.23 | -0.087 | 0.335 |
| -3.545500000000161 | -0.234 | -0.081 | 0.331 |
| -3.542000000000161 | -0.237 | -0.075 | 0.327 |
| -3.538500000000162 | -0.241 | -0.069 | 0.323 |
| -3.535000000000162 | -0.244 | -0.062 | 0.319 |
| -3.531500000000162 | -0.248 | -0.056 | 0.315 |
| -3.528000000000162 | -0.252 | -0.05 | 0.311 |
| -3.524500000000162 | -0.255 | -0.044 | 0.308 |
| -3.521000000000162 | -0.259 | -0.037 | 0.304 |
| -3.517500000000163 | -0.263 | -0.031 | 0.3 |
| -3.514000000000163 | -0.266 | -0.025 | 0.296 |
| -3.510500000000163 | -0.27 | -0.019 | 0.292 |
| -3.507000000000163 | -0.274 | -0.012 | 0.289 |
| -3.503500000000163 | -0.277 | -0.006 | 0.285 |
| -3.500000000000163 | -0.281 | 0 | 0.281 |
| -3.496500000000164 | -0.285 | 0.006 | 0.277 |
| -3.493000000000164 | -0.289 | 0.012 | 0.274 |
| -3.489500000000164 | -0.292 | 0.019 | 0.27 |
| -3.486000000000164 | -0.296 | 0.025 | 0.266 |
| -3.482500000000164 | -0.3 | 0.031 | 0.263 |
| -3.479000000000164 | -0.304 | 0.037 | 0.259 |
| -3.475500000000165 | -0.308 | 0.044 | 0.255 |
| -3.472000000000165 | -0.311 | 0.05 | 0.252 |
| -3.468500000000165 | -0.315 | 0.056 | 0.248 |
| -3.465000000000165 | -0.319 | 0.062 | 0.244 |
| -3.461500000000165 | -0.323 | 0.069 | 0.241 |
| -3.458000000000165 | -0.327 | 0.075 | 0.237 |
| -3.454500000000166 | -0.331 | 0.081 | 0.234 |
| -3.451000000000166 | -0.335 | 0.087 | 0.23 |
| -3.447500000000166 | -0.339 | 0.094 | 0.226 |
| -3.444000000000166 | -0.343 | 0.1 | 0.223 |
| -3.440500000000166 | -0.347 | 0.106 | 0.219 |
| -3.437000000000166 | -0.351 | 0.113 | 0.216 |
| -3.433500000000167 | -0.355 | 0.119 | 0.212 |
| -3.430000000000167 | -0.359 | 0.125 | 0.209 |
| -3.426500000000167 | -0.363 | 0.132 | 0.205 |
| -3.423000000000167 | -0.367 | 0.138 | 0.202 |
| -3.419500000000167 | -0.372 | 0.145 | 0.198 |
| -3.416000000000167 | -0.376 | 0.151 | 0.195 |
| -3.412500000000167 | -0.38 | 0.157 | 0.191 |
| -3.409000000000168 | -0.384 | 0.164 | 0.187 |
| -3.405500000000168 | -0.389 | 0.17 | 0.184 |
| -3.402000000000168 | -0.393 | 0.177 | 0.18 |
| -3.398500000000168 | -0.397 | 0.183 | 0.177 |
| -3.395000000000168 | -0.402 | 0.19 | 0.173 |
| -3.391500000000168 | -0.406 | 0.196 | 0.17 |
| -3.388000000000169 | -0.41 | 0.203 | 0.166 |
| -3.384500000000169 | -0.415 | 0.21 | 0.163 |
| -3.381000000000169 | -0.419 | 0.216 | 0.159 |
| -3.377500000000169 | -0.424 | 0.223 | 0.156 |
| -3.374000000000169 | -0.428 | 0.229 | 0.152 |
| -3.370500000000169 | -0.433 | 0.236 | 0.149 |
| -3.36700000000017 | -0.438 | 0.243 | 0.145 |
| -3.36350000000017 | -0.442 | 0.25 | 0.142 |
| -3.36000000000017 | -0.447 | 0.256 | 0.138 |
| -3.35650000000017 | -0.452 | 0.263 | 0.135 |
| -3.35300000000017 | -0.457 | 0.27 | 0.131 |
| -3.34950000000017 | -0.461 | 0.277 | 0.128 |
| -3.346000000000171 | -0.466 | 0.284 | 0.124 |
| -3.342500000000171 | -0.471 | 0.291 | 0.121 |
| -3.339000000000171 | -0.476 | 0.298 | 0.117 |
| -3.335500000000171 | -0.481 | 0.305 | 0.114 |
| -3.332000000000171 | -0.486 | 0.312 | 0.11 |
| -3.328500000000171 | -0.491 | 0.319 | 0.107 |
| -3.325000000000172 | -0.497 | 0.326 | 0.103 |
| -3.321500000000172 | -0.502 | 0.334 | 0.1 |
| -3.318000000000172 | -0.507 | 0.341 | 0.096 |
| -3.314500000000172 | -0.512 | 0.348 | 0.092 |
| -3.311000000000172 | -0.518 | 0.355 | 0.089 |
| -3.307500000000172 | -0.523 | 0.363 | 0.085 |
| -3.304000000000173 | -0.529 | 0.37 | 0.082 |
| -3.300500000000173 | -0.534 | 0.378 | 0.078 |
| -3.297000000000173 | -0.54 | 0.385 | 0.074 |
| -3.293500000000173 | -0.545 | 0.393 | 0.071 |
| -3.290000000000173 | -0.551 | 0.401 | 0.067 |
| -3.286500000000173 | -0.557 | 0.408 | 0.063 |
| -3.283000000000173 | -0.563 | 0.416 | 0.06 |
| -3.279500000000174 | -0.569 | 0.424 | 0.056 |
| -3.276000000000174 | -0.575 | 0.432 | 0.052 |
| -3.272500000000174 | -0.581 | 0.44 | 0.048 |
| -3.269000000000174 | -0.587 | 0.448 | 0.045 |
| -3.265500000000174 | -0.593 | 0.456 | 0.041 |
| -3.262000000000175 | -0.599 | 0.464 | 0.037 |
| -3.258500000000175 | -0.606 | 0.473 | 0.033 |
| -3.255000000000175 | -0.612 | 0.481 | 0.03 |
| -3.251500000000175 | -0.619 | 0.49 | 0.026 |
| -3.248000000000175 | -0.625 | 0.498 | 0.022 |
| -3.244500000000175 | -0.632 | 0.507 | 0.018 |
| -3.241000000000175 | -0.639 | 0.515 | 0.014 |
| -3.237500000000176 | -0.646 | 0.524 | 0.01 |
| -3.234000000000176 | -0.653 | 0.533 | 0.006 |
| -3.230500000000176 | -0.66 | 0.542 | 0.002 |
| -3.227000000000176 | -0.667 | 0.551 | -0.002 |
| -3.223500000000176 | -0.675 | 0.561 | -0.006 |
| -3.220000000000176 | -0.682 | 0.57 | -0.01 |
| -3.216500000000177 | -0.69 | 0.579 | -0.014 |
| -3.213000000000177 | -0.697 | 0.589 | -0.019 |
| -3.209500000000177 | -0.705 | 0.599 | -0.023 |
| -3.206000000000177 | -0.713 | 0.608 | -0.027 |
| -3.202500000000177 | -0.721 | 0.618 | -0.031 |
| -3.199000000000177 | -0.73 | 0.628 | -0.036 |
| -3.195500000000178 | -0.738 | 0.639 | -0.04 |
| -3.192000000000178 | -0.747 | 0.649 | -0.044 |
| -3.188500000000178 | -0.755 | 0.66 | -0.049 |
| -3.185000000000178 | -0.764 | 0.67 | -0.053 |
| -3.181500000000178 | -0.773 | 0.681 | -0.058 |
| -3.178000000000178 | -0.782 | 0.692 | -0.063 |
| -3.174500000000179 | -0.792 | 0.704 | -0.067 |
| -3.171000000000179 | -0.802 | 0.715 | -0.072 |
| -3.167500000000179 | -0.811 | 0.727 | -0.077 |
| -3.16400000000018 | -0.821 | 0.738 | -0.082 |
| -3.16050000000018 | -0.832 | 0.75 | -0.087 |
| -3.157000000000179 | -0.842 | 0.763 | -0.092 |
| -3.15350000000018 | -0.853 | 0.775 | -0.097 |
| -3.15000000000018 | -0.864 | 0.788 | -0.102 |
| -3.14650000000018 | -0.875 | 0.801 | -0.107 |
| -3.14300000000018 | -0.887 | 0.814 | -0.112 |
| -3.13950000000018 | -0.898 | 0.828 | -0.118 |
| -3.13600000000018 | -0.91 | 0.842 | -0.123 |
| -3.132500000000181 | -0.923 | 0.856 | -0.129 |
| -3.129000000000181 | -0.936 | 0.871 | -0.135 |
| -3.125500000000181 | -0.949 | 0.886 | -0.141 |
| -3.122000000000181 | -0.962 | 0.901 | -0.147 |
| -3.118500000000181 | -0.976 | 0.917 | -0.153 |
| -3.115000000000181 | -0.991 | 0.933 | -0.159 |
| -3.111500000000182 | -1.005 | 0.949 | -0.165 |
| -3.108000000000182 | -1.021 | 0.966 | -0.172 |
| -3.104500000000182 | -1.037 | 0.984 | -0.179 |
| -3.101000000000182 | -1.053 | 1.002 | -0.186 |
| -3.097500000000182 | -1.07 | 1.021 | -0.193 |
| -3.094000000000182 | -1.088 | 1.04 | -0.2 |
| -3.090500000000183 | -1.106 | 1.06 | -0.208 |
| -3.087000000000183 | -1.125 | 1.081 | -0.215 |
| -3.083500000000183 | -1.145 | 1.103 | -0.223 |
| -3.080000000000183 | -1.165 | 1.125 | -0.232 |
| -3.076500000000183 | -1.187 | 1.149 | -0.24 |
| -3.073000000000183 | -1.21 | 1.173 | -0.249 |
| -3.069500000000184 | -1.234 | 1.199 | -0.259 |
| -3.066000000000184 | -1.259 | 1.226 | -0.268 |
| -3.062500000000184 | -1.285 | 1.254 | -0.279 |
| -3.059000000000184 | -1.313 | 1.284 | -0.289 |
| -3.055500000000184 | -1.343 | 1.315 | -0.301 |
| -3.052000000000184 | -1.375 | 1.349 | -0.313 |
| -3.048500000000184 | -1.409 | 1.385 | -0.326 |
| -3.045000000000185 | -1.446 | 1.423 | -0.339 |
| -3.041500000000185 | -1.485 | 1.465 | -0.354 |
| -3.038000000000185 | -1.529 | 1.51 | -0.37 |
| -3.034500000000185 | -1.576 | 1.559 | -0.387 |
| -3.031000000000185 | -1.629 | 1.613 | -0.406 |
| -3.027500000000185 | -1.688 | 1.674 | -0.427 |
| -3.024000000000186 | -1.755 | 1.743 | -0.451 |
| -3.020500000000186 | -1.833 | 1.823 | -0.478 |
| -3.017000000000186 | -1.926 | 1.917 | -0.51 |
| -3.013500000000186 | -2.04 | 2.034 | -0.55 |
| -3.010000000000186 | -2.19 | 2.185 | -0.601 |
| -3.006500000000186 | -2.404 | 2.401 | -0.674 |
| -3.003000000000187 | -2.79 | 2.788 | -0.804 |
| -2.999500000000187 | -10 | 10 | -10 |
| -2.996000000000187 | -2.644 | 2.646 | -0.758 |
| -2.992500000000187 | -2.329 | 2.333 | -0.654 |
| -2.989000000000187 | -2.137 | 2.142 | -0.592 |
| -2.985500000000187 | -1.998 | 2.005 | -0.547 |
| -2.982000000000188 | -1.889 | 1.898 | -0.512 |
| -2.978500000000188 | -1.799 | 1.81 | -0.483 |
| -2.975000000000188 | -1.722 | 1.735 | -0.459 |
| -2.971500000000188 | -1.656 | 1.67 | -0.438 |
| -2.968000000000188 | -1.597 | 1.613 | -0.42 |
| -2.964500000000188 | -1.544 | 1.562 | -0.404 |
| -2.961000000000189 | -1.496 | 1.516 | -0.389 |
| -2.957500000000189 | -1.452 | 1.474 | -0.376 |
| -2.954000000000189 | -1.412 | 1.435 | -0.363 |
| -2.950500000000189 | -1.374 | 1.399 | -0.352 |
| -2.947000000000189 | -1.339 | 1.366 | -0.342 |
| -2.943500000000189 | -1.306 | 1.334 | -0.332 |
| -2.94000000000019 | -1.275 | 1.305 | -0.323 |
| -2.93650000000019 | -1.246 | 1.277 | -0.315 |
| -2.93300000000019 | -1.218 | 1.251 | -0.307 |
| -2.92950000000019 | -1.191 | 1.227 | -0.299 |
| -2.92600000000019 | -1.166 | 1.203 | -0.292 |
| -2.92250000000019 | -1.142 | 1.181 | -0.285 |
| -2.919000000000191 | -1.119 | 1.159 | -0.279 |
| -2.915500000000191 | -1.097 | 1.139 | -0.273 |
| -2.912000000000191 | -1.075 | 1.119 | -0.267 |
| -2.908500000000191 | -1.055 | 1.101 | -0.262 |
| -2.905000000000191 | -1.035 | 1.082 | -0.256 |
| -2.901500000000191 | -1.016 | 1.065 | -0.251 |
| -2.898000000000191 | -0.997 | 1.048 | -0.246 |
| -2.894500000000192 | -0.979 | 1.032 | -0.242 |
| -2.891000000000192 | -0.962 | 1.016 | -0.237 |
| -2.887500000000192 | -0.945 | 1.001 | -0.233 |
| -2.884000000000192 | -0.928 | 0.986 | -0.229 |
| -2.880500000000192 | -0.912 | 0.972 | -0.225 |
| -2.877000000000192 | -0.897 | 0.958 | -0.221 |
| -2.873500000000193 | -0.881 | 0.945 | -0.217 |
| -2.870000000000193 | -0.867 | 0.932 | -0.213 |
| -2.866500000000193 | -0.852 | 0.919 | -0.21 |
| -2.863000000000193 | -0.838 | 0.907 | -0.206 |
| -2.859500000000193 | -0.824 | 0.895 | -0.203 |
| -2.856000000000193 | -0.811 | 0.883 | -0.2 |
| -2.852500000000194 | -0.797 | 0.872 | -0.197 |
| -2.849000000000194 | -0.784 | 0.861 | -0.194 |
| -2.845500000000194 | -0.772 | 0.85 | -0.191 |
| -2.842000000000194 | -0.759 | 0.839 | -0.188 |
| -2.838500000000194 | -0.747 | 0.829 | -0.185 |
| -2.835000000000194 | -0.735 | 0.818 | -0.182 |
| -2.831500000000195 | -0.723 | 0.809 | -0.18 |
| -2.828000000000195 | -0.712 | 0.799 | -0.177 |
| -2.824500000000195 | -0.7 | 0.789 | -0.175 |
| -2.821000000000195 | -0.689 | 0.78 | -0.172 |
| -2.817500000000195 | -0.678 | 0.771 | -0.17 |
| -2.814000000000195 | -0.667 | 0.762 | -0.168 |
| -2.810500000000196 | -0.657 | 0.753 | -0.165 |
| -2.807000000000196 | -0.646 | 0.744 | -0.163 |
| -2.803500000000196 | -0.636 | 0.736 | -0.161 |
| -2.800000000000196 | -0.626 | 0.727 | -0.159 |
| -2.796500000000196 | -0.616 | 0.719 | -0.157 |
| -2.793000000000196 | -0.606 | 0.711 | -0.155 |
| -2.789500000000196 | -0.596 | 0.703 | -0.153 |
| -2.786000000000197 | -0.586 | 0.695 | -0.151 |
| -2.782500000000197 | -0.577 | 0.688 | -0.149 |
| -2.779000000000197 | -0.567 | 0.68 | -0.147 |
| -2.775500000000197 | -0.558 | 0.673 | -0.146 |
| -2.772000000000197 | -0.549 | 0.665 | -0.144 |
| -2.768500000000197 | -0.54 | 0.658 | -0.142 |
| -2.765000000000198 | -0.531 | 0.651 | -0.14 |
| -2.761500000000198 | -0.522 | 0.644 | -0.139 |
| -2.758000000000198 | -0.513 | 0.637 | -0.137 |
| -2.754500000000198 | -0.504 | 0.63 | -0.136 |
| -2.751000000000198 | -0.496 | 0.624 | -0.134 |
| -2.747500000000198 | -0.487 | 0.617 | -0.133 |
| -2.744000000000199 | -0.479 | 0.61 | -0.131 |
| -2.740500000000199 | -0.47 | 0.604 | -0.13 |
| -2.737000000000199 | -0.462 | 0.598 | -0.128 |
| -2.7335000000002 | -0.454 | 0.591 | -0.127 |
| -2.730000000000199 | -0.446 | 0.585 | -0.125 |
| -2.726500000000199 | -0.438 | 0.579 | -0.124 |
| -2.7230000000002 | -0.43 | 0.573 | -0.123 |
| -2.7195000000002 | -0.422 | 0.567 | -0.121 |
| -2.7160000000002 | -0.414 | 0.561 | -0.12 |
| -2.7125000000002 | -0.406 | 0.555 | -0.119 |
| -2.7090000000002 | -0.399 | 0.549 | -0.117 |
| -2.7055000000002 | -0.391 | 0.544 | -0.116 |
| -2.702000000000201 | -0.383 | 0.538 | -0.115 |
| -2.698500000000201 | -0.376 | 0.533 | -0.114 |
| -2.695000000000201 | -0.368 | 0.527 | -0.113 |
| -2.691500000000201 | -0.361 | 0.522 | -0.112 |
| -2.688000000000201 | -0.353 | 0.516 | -0.11 |
| -2.684500000000201 | -0.346 | 0.511 | -0.109 |
| -2.681000000000202 | -0.339 | 0.505 | -0.108 |
| -2.677500000000202 | -0.332 | 0.5 | -0.107 |
| -2.674000000000202 | -0.324 | 0.495 | -0.106 |
| -2.670500000000202 | -0.317 | 0.49 | -0.105 |
| -2.667000000000202 | -0.31 | 0.485 | -0.104 |
| -2.663500000000202 | -0.303 | 0.48 | -0.103 |
| -2.660000000000203 | -0.296 | 0.475 | -0.102 |
| -2.656500000000203 | -0.289 | 0.47 | -0.101 |
| -2.653000000000203 | -0.282 | 0.465 | -0.1 |
| -2.649500000000203 | -0.275 | 0.46 | -0.099 |
| -2.646000000000203 | -0.268 | 0.455 | -0.098 |
| -2.642500000000203 | -0.261 | 0.45 | -0.097 |
| -2.639000000000204 | -0.255 | 0.446 | -0.096 |
| -2.635500000000204 | -0.248 | 0.441 | -0.096 |
| -2.632000000000204 | -0.241 | 0.436 | -0.095 |
| -2.628500000000204 | -0.234 | 0.432 | -0.094 |
| -2.625000000000204 | -0.228 | 0.427 | -0.093 |
| -2.621500000000204 | -0.221 | 0.423 | -0.092 |
| -2.618000000000205 | -0.214 | 0.418 | -0.091 |
| -2.614500000000205 | -0.208 | 0.414 | -0.09 |
| -2.611000000000205 | -0.201 | 0.409 | -0.09 |
| -2.607500000000205 | -0.194 | 0.405 | -0.089 |
| -2.604000000000205 | -0.188 | 0.4 | -0.088 |
| -2.600500000000205 | -0.181 | 0.396 | -0.087 |
| -2.597000000000206 | -0.175 | 0.392 | -0.087 |
| -2.593500000000206 | -0.168 | 0.387 | -0.086 |
| -2.590000000000206 | -0.162 | 0.383 | -0.085 |
| -2.586500000000206 | -0.156 | 0.379 | -0.084 |
| -2.583000000000206 | -0.149 | 0.375 | -0.084 |
| -2.579500000000206 | -0.143 | 0.37 | -0.083 |
| -2.576000000000207 | -0.136 | 0.366 | -0.082 |
| -2.572500000000207 | -0.13 | 0.362 | -0.081 |
| -2.569000000000207 | -0.124 | 0.358 | -0.081 |
| -2.565500000000207 | -0.117 | 0.354 | -0.08 |
| -2.562000000000207 | -0.111 | 0.35 | -0.079 |
| -2.558500000000207 | -0.105 | 0.346 | -0.079 |
| -2.555000000000208 | -0.098 | 0.342 | -0.078 |
| -2.551500000000208 | -0.092 | 0.338 | -0.077 |
| -2.548000000000208 | -0.086 | 0.334 | -0.077 |
| -2.544500000000208 | -0.079 | 0.33 | -0.076 |
| -2.541000000000208 | -0.073 | 0.326 | -0.076 |
| -2.537500000000208 | -0.067 | 0.322 | -0.075 |
| -2.534000000000209 | -0.061 | 0.318 | -0.074 |
| -2.530500000000209 | -0.054 | 0.314 | -0.074 |
| -2.527000000000209 | -0.048 | 0.31 | -0.073 |
| -2.52350000000021 | -0.042 | 0.306 | -0.073 |
| -2.520000000000209 | -0.036 | 0.303 | -0.072 |
| -2.516500000000209 | -0.029 | 0.299 | -0.071 |
| -2.51300000000021 | -0.023 | 0.295 | -0.071 |
| -2.50950000000021 | -0.017 | 0.291 | -0.07 |
| -2.50600000000021 | -0.011 | 0.287 | -0.07 |
| -2.50250000000021 | -0.004 | 0.284 | -0.069 |
| -2.49900000000021 | 0.002 | 0.28 | -0.069 |
| -2.49550000000021 | 0.008 | 0.276 | -0.068 |
| -2.49200000000021 | 0.014 | 0.273 | -0.068 |
| -2.488500000000211 | 0.02 | 0.269 | -0.067 |
| -2.485000000000211 | 0.027 | 0.265 | -0.067 |
| -2.481500000000211 | 0.033 | 0.262 | -0.066 |
| -2.478000000000211 | 0.039 | 0.258 | -0.066 |
| -2.474500000000211 | 0.045 | 0.254 | -0.065 |
| -2.471000000000211 | 0.052 | 0.251 | -0.065 |
| -2.467500000000212 | 0.058 | 0.247 | -0.064 |
| -2.464000000000212 | 0.064 | 0.243 | -0.064 |
| -2.460500000000212 | 0.07 | 0.24 | -0.063 |
| -2.457000000000212 | 0.077 | 0.236 | -0.063 |
| -2.453500000000212 | 0.083 | 0.233 | -0.062 |
| -2.450000000000212 | 0.089 | 0.229 | -0.062 |
| -2.446500000000213 | 0.096 | 0.225 | -0.061 |
| -2.443000000000213 | 0.102 | 0.222 | -0.061 |
| -2.439500000000213 | 0.108 | 0.218 | -0.061 |
| -2.436000000000213 | 0.114 | 0.215 | -0.06 |
| -2.432500000000213 | 0.121 | 0.211 | -0.06 |
| -2.429000000000213 | 0.127 | 0.208 | -0.059 |
| -2.425500000000214 | 0.134 | 0.204 | -0.059 |
| -2.422000000000214 | 0.14 | 0.201 | -0.058 |
| -2.418500000000214 | 0.146 | 0.197 | -0.058 |
| -2.415000000000214 | 0.153 | 0.193 | -0.058 |
| -2.411500000000214 | 0.159 | 0.19 | -0.057 |
| -2.408000000000214 | 0.166 | 0.186 | -0.057 |
| -2.404500000000215 | 0.172 | 0.183 | -0.056 |
| -2.401000000000215 | 0.179 | 0.179 | -0.056 |
| -2.397500000000215 | 0.185 | 0.176 | -0.056 |
| -2.394000000000215 | 0.192 | 0.172 | -0.055 |
| -2.390500000000215 | 0.198 | 0.169 | -0.055 |
| -2.387000000000215 | 0.205 | 0.165 | -0.054 |
| -2.383500000000215 | 0.211 | 0.162 | -0.054 |
| -2.380000000000216 | 0.218 | 0.158 | -0.054 |
| -2.376500000000216 | 0.225 | 0.155 | -0.053 |
| -2.373000000000216 | 0.231 | 0.151 | -0.053 |
| -2.369500000000216 | 0.238 | 0.148 | -0.053 |
| -2.366000000000216 | 0.245 | 0.144 | -0.052 |
| -2.362500000000216 | 0.252 | 0.141 | -0.052 |
| -2.359000000000217 | 0.258 | 0.137 | -0.052 |
| -2.355500000000217 | 0.265 | 0.134 | -0.051 |
| -2.352000000000217 | 0.272 | 0.13 | -0.051 |
| -2.348500000000217 | 0.279 | 0.127 | -0.051 |
| -2.345000000000217 | 0.286 | 0.123 | -0.05 |
| -2.341500000000217 | 0.293 | 0.12 | -0.05 |
| -2.338000000000218 | 0.3 | 0.116 | -0.05 |
| -2.334500000000218 | 0.307 | 0.113 | -0.049 |
| -2.331000000000218 | 0.314 | 0.109 | -0.049 |
| -2.327500000000218 | 0.321 | 0.106 | -0.049 |
| -2.324000000000218 | 0.328 | 0.102 | -0.048 |
| -2.320500000000218 | 0.336 | 0.099 | -0.048 |
| -2.317000000000219 | 0.343 | 0.095 | -0.048 |
| -2.313500000000219 | 0.35 | 0.091 | -0.047 |
| -2.310000000000219 | 0.358 | 0.088 | -0.047 |
| -2.306500000000219 | 0.365 | 0.084 | -0.047 |
| -2.303000000000219 | 0.372 | 0.081 | -0.046 |
| -2.299500000000219 | 0.38 | 0.077 | -0.046 |
| -2.29600000000022 | 0.388 | 0.073 | -0.046 |
| -2.29250000000022 | 0.395 | 0.07 | -0.046 |
| -2.28900000000022 | 0.403 | 0.066 | -0.045 |
| -2.28550000000022 | 0.411 | 0.062 | -0.045 |
| -2.28200000000022 | 0.418 | 0.059 | -0.045 |
| -2.27850000000022 | 0.426 | 0.055 | -0.044 |
| -2.275000000000221 | 0.434 | 0.051 | -0.044 |
| -2.271500000000221 | 0.442 | 0.047 | -0.044 |
| -2.268000000000221 | 0.45 | 0.044 | -0.044 |
| -2.264500000000221 | 0.459 | 0.04 | -0.043 |
| -2.261000000000221 | 0.467 | 0.036 | -0.043 |
| -2.257500000000221 | 0.475 | 0.032 | -0.043 |
| -2.254000000000222 | 0.484 | 0.028 | -0.043 |
| -2.250500000000222 | 0.492 | 0.025 | -0.042 |
| -2.247000000000222 | 0.501 | 0.021 | -0.042 |
| -2.243500000000222 | 0.509 | 0.017 | -0.042 |
| -2.240000000000222 | 0.518 | 0.013 | -0.042 |
| -2.236500000000222 | 0.527 | 0.009 | -0.041 |
| -2.233000000000223 | 0.536 | 0.005 | -0.041 |
| -2.229500000000223 | 0.545 | 0.001 | -0.041 |
| -2.226000000000223 | 0.554 | -0.003 | -0.041 |
| -2.222500000000223 | 0.563 | -0.007 | -0.04 |
| -2.219000000000223 | 0.573 | -0.011 | -0.04 |
| -2.215500000000223 | 0.582 | -0.016 | -0.04 |
| -2.212000000000224 | 0.592 | -0.02 | -0.04 |
| -2.208500000000224 | 0.601 | -0.024 | -0.039 |
| -2.205000000000224 | 0.611 | -0.028 | -0.039 |
| -2.201500000000224 | 0.621 | -0.033 | -0.039 |
| -2.198000000000224 | 0.631 | -0.037 | -0.039 |
| -2.194500000000224 | 0.642 | -0.041 | -0.038 |
| -2.191000000000225 | 0.652 | -0.046 | -0.038 |
| -2.187500000000225 | 0.663 | -0.05 | -0.038 |
| -2.184000000000225 | 0.673 | -0.055 | -0.038 |
| -2.180500000000225 | 0.684 | -0.059 | -0.038 |
| -2.177000000000225 | 0.695 | -0.064 | -0.037 |
| -2.173500000000225 | 0.707 | -0.069 | -0.037 |
| -2.170000000000226 | 0.718 | -0.073 | -0.037 |
| -2.166500000000226 | 0.73 | -0.078 | -0.037 |
| -2.163000000000226 | 0.742 | -0.083 | -0.036 |
| -2.159500000000226 | 0.754 | -0.088 | -0.036 |
| -2.156000000000226 | 0.766 | -0.093 | -0.036 |
| -2.152500000000226 | 0.779 | -0.098 | -0.036 |
| -2.149000000000226 | 0.792 | -0.103 | -0.036 |
| -2.145500000000227 | 0.805 | -0.109 | -0.035 |
| -2.142000000000227 | 0.818 | -0.114 | -0.035 |
| -2.138500000000227 | 0.832 | -0.119 | -0.035 |
| -2.135000000000227 | 0.846 | -0.125 | -0.035 |
| -2.131500000000227 | 0.86 | -0.131 | -0.035 |
| -2.128000000000227 | 0.875 | -0.136 | -0.034 |
| -2.124500000000228 | 0.89 | -0.142 | -0.034 |
| -2.121000000000228 | 0.905 | -0.148 | -0.034 |
| -2.117500000000228 | 0.921 | -0.155 | -0.034 |
| -2.114000000000228 | 0.938 | -0.161 | -0.034 |
| -2.110500000000228 | 0.954 | -0.167 | -0.034 |
| -2.107000000000228 | 0.971 | -0.174 | -0.033 |
| -2.103500000000229 | 0.989 | -0.181 | -0.033 |
| -2.100000000000229 | 1.008 | -0.188 | -0.033 |
| -2.096500000000229 | 1.026 | -0.195 | -0.033 |
| -2.093000000000229 | 1.046 | -0.202 | -0.033 |
| -2.089500000000229 | 1.066 | -0.21 | -0.032 |
| -2.086000000000229 | 1.087 | -0.218 | -0.032 |
| -2.08250000000023 | 1.109 | -0.226 | -0.032 |
| -2.07900000000023 | 1.132 | -0.234 | -0.032 |
| -2.07550000000023 | 1.156 | -0.243 | -0.032 |
| -2.07200000000023 | 1.18 | -0.252 | -0.032 |
| -2.06850000000023 | 1.206 | -0.261 | -0.031 |
| -2.06500000000023 | 1.234 | -0.271 | -0.031 |
| -2.061500000000231 | 1.262 | -0.282 | -0.031 |
| -2.058000000000231 | 1.293 | -0.293 | -0.031 |
| -2.054500000000231 | 1.325 | -0.304 | -0.031 |
| -2.051000000000231 | 1.359 | -0.316 | -0.031 |
| -2.047500000000231 | 1.395 | -0.329 | -0.03 |
| -2.044000000000231 | 1.435 | -0.343 | -0.03 |
| -2.040500000000232 | 1.477 | -0.358 | -0.03 |
| -2.037000000000232 | 1.523 | -0.374 | -0.03 |
| -2.033500000000232 | 1.574 | -0.392 | -0.03 |
| -2.030000000000232 | 1.63 | -0.412 | -0.03 |
| -2.026500000000232 | 1.693 | -0.433 | -0.029 |
| -2.023000000000232 | 1.765 | -0.458 | -0.029 |
| -2.019500000000233 | 1.848 | -0.487 | -0.029 |
| -2.016000000000233 | 1.948 | -0.521 | -0.029 |
| -2.012500000000233 | 2.072 | -0.563 | -0.029 |
| -2.009000000000233 | 2.237 | -0.619 | -0.029 |
| -2.005500000000233 | 2.485 | -0.702 | -0.029 |
| -2.002000000000233 | 2.991 | -0.872 | -0.028 |
| -1.998500000000233 | 10 | -10 | -0.028 |
| -1.995000000000233 | 2.535 | -0.721 | -0.028 |
| -1.991500000000233 | 2.27 | -0.634 | -0.028 |
| -1.988000000000233 | 2.099 | -0.577 | -0.028 |
| -1.984500000000233 | 1.972 | -0.536 | -0.028 |
| -1.981000000000233 | 1.871 | -0.503 | -0.028 |
| -1.977500000000233 | 1.787 | -0.476 | -0.027 |
| -1.974000000000233 | 1.716 | -0.453 | -0.027 |
| -1.970500000000233 | 1.653 | -0.433 | -0.027 |
| -1.967000000000233 | 1.598 | -0.415 | -0.027 |
| -1.963500000000233 | 1.548 | -0.399 | -0.027 |
| -1.960000000000233 | 1.503 | -0.385 | -0.027 |
| -1.956500000000233 | 1.462 | -0.372 | -0.027 |
| -1.953000000000233 | 1.424 | -0.36 | -0.026 |
| -1.949500000000232 | 1.389 | -0.349 | -0.026 |
| -1.946000000000232 | 1.356 | -0.339 | -0.026 |
| -1.942500000000232 | 1.326 | -0.329 | -0.026 |
| -1.939000000000232 | 1.297 | -0.321 | -0.026 |
| -1.935500000000232 | 1.27 | -0.312 | -0.026 |
| -1.932000000000232 | 1.244 | -0.304 | -0.026 |
| -1.928500000000232 | 1.22 | -0.297 | -0.026 |
| -1.925000000000232 | 1.197 | -0.29 | -0.025 |
| -1.921500000000232 | 1.175 | -0.283 | -0.025 |
| -1.918000000000232 | 1.153 | -0.277 | -0.025 |
| -1.914500000000232 | 1.133 | -0.271 | -0.025 |
| -1.911000000000232 | 1.114 | -0.265 | -0.025 |
| -1.907500000000232 | 1.095 | -0.26 | -0.025 |
| -1.904000000000232 | 1.077 | -0.255 | -0.025 |
| -1.900500000000232 | 1.06 | -0.25 | -0.025 |
| -1.897000000000232 | 1.044 | -0.245 | -0.024 |
| -1.893500000000231 | 1.027 | -0.24 | -0.024 |
| -1.890000000000231 | 1.012 | -0.236 | -0.024 |
| -1.886500000000231 | 0.997 | -0.232 | -0.024 |
| -1.883000000000231 | 0.982 | -0.227 | -0.024 |
| -1.879500000000231 | 0.968 | -0.223 | -0.024 |
| -1.876000000000231 | 0.955 | -0.22 | -0.024 |
| -1.872500000000231 | 0.941 | -0.216 | -0.024 |
| -1.869000000000231 | 0.928 | -0.212 | -0.024 |
| -1.865500000000231 | 0.916 | -0.209 | -0.023 |
| -1.862000000000231 | 0.903 | -0.205 | -0.023 |
| -1.858500000000231 | 0.892 | -0.202 | -0.023 |
| -1.855000000000231 | 0.88 | -0.199 | -0.023 |
| -1.851500000000231 | 0.869 | -0.196 | -0.023 |
| -1.848000000000231 | 0.857 | -0.193 | -0.023 |
| -1.844500000000231 | 0.847 | -0.19 | -0.023 |
| -1.841000000000231 | 0.836 | -0.187 | -0.023 |
| -1.837500000000231 | 0.826 | -0.184 | -0.023 |
| -1.834000000000231 | 0.816 | -0.182 | -0.022 |
| -1.83050000000023 | 0.806 | -0.179 | -0.022 |
| -1.82700000000023 | 0.796 | -0.177 | -0.022 |
| -1.82350000000023 | 0.787 | -0.174 | -0.022 |
| -1.82000000000023 | 0.777 | -0.172 | -0.022 |
| -1.81650000000023 | 0.768 | -0.169 | -0.022 |
| -1.81300000000023 | 0.759 | -0.167 | -0.022 |
| -1.80950000000023 | 0.75 | -0.165 | -0.022 |
| -1.80600000000023 | 0.742 | -0.163 | -0.022 |
| -1.80250000000023 | 0.733 | -0.161 | -0.022 |
| -1.79900000000023 | 0.725 | -0.158 | -0.021 |
| -1.79550000000023 | 0.717 | -0.156 | -0.021 |
| -1.79200000000023 | 0.709 | -0.154 | -0.021 |
| -1.78850000000023 | 0.701 | -0.152 | -0.021 |
| -1.78500000000023 | 0.693 | -0.151 | -0.021 |
| -1.78150000000023 | 0.685 | -0.149 | -0.021 |
| -1.77800000000023 | 0.678 | -0.147 | -0.021 |
| -1.774500000000229 | 0.67 | -0.145 | -0.021 |
| -1.771000000000229 | 0.663 | -0.143 | -0.021 |
| -1.767500000000229 | 0.656 | -0.142 | -0.021 |
| -1.76400000000023 | 0.649 | -0.14 | -0.02 |
| -1.76050000000023 | 0.642 | -0.138 | -0.02 |
| -1.75700000000023 | 0.635 | -0.137 | -0.02 |
| -1.75350000000023 | 0.628 | -0.135 | -0.02 |
| -1.75000000000023 | 0.622 | -0.134 | -0.02 |
| -1.74650000000023 | 0.615 | -0.132 | -0.02 |
| -1.743000000000229 | 0.609 | -0.131 | -0.02 |
| -1.739500000000229 | 0.602 | -0.129 | -0.02 |
| -1.736000000000229 | 0.596 | -0.128 | -0.02 |
| -1.732500000000229 | 0.59 | -0.126 | -0.02 |
| -1.729000000000229 | 0.583 | -0.125 | -0.02 |
| -1.725500000000229 | 0.577 | -0.124 | -0.019 |
| -1.722000000000229 | 0.571 | -0.122 | -0.019 |
| -1.718500000000229 | 0.565 | -0.121 | -0.019 |
| -1.715000000000228 | 0.559 | -0.12 | -0.019 |
| -1.711500000000228 | 0.554 | -0.118 | -0.019 |
| -1.708000000000228 | 0.548 | -0.117 | -0.019 |
| -1.704500000000228 | 0.542 | -0.116 | -0.019 |
| -1.701000000000228 | 0.536 | -0.115 | -0.019 |
| -1.697500000000228 | 0.531 | -0.114 | -0.019 |
| -1.694000000000228 | 0.525 | -0.112 | -0.019 |
| -1.690500000000228 | 0.52 | -0.111 | -0.019 |
| -1.687000000000228 | 0.515 | -0.11 | -0.019 |
| -1.683500000000228 | 0.509 | -0.109 | -0.018 |
| -1.680000000000228 | 0.504 | -0.108 | -0.018 |
| -1.676500000000228 | 0.499 | -0.107 | -0.018 |
| -1.673000000000228 | 0.494 | -0.106 | -0.018 |
| -1.669500000000228 | 0.488 | -0.105 | -0.018 |
| -1.666000000000228 | 0.483 | -0.104 | -0.018 |
| -1.662500000000228 | 0.478 | -0.103 | -0.018 |
| -1.659000000000228 | 0.473 | -0.102 | -0.018 |
| -1.655500000000227 | 0.468 | -0.101 | -0.018 |
| -1.652000000000227 | 0.464 | -0.1 | -0.018 |
| -1.648500000000227 | 0.459 | -0.099 | -0.018 |
| -1.645000000000227 | 0.454 | -0.098 | -0.018 |
| -1.641500000000227 | 0.449 | -0.097 | -0.018 |
| -1.638000000000227 | 0.444 | -0.096 | -0.017 |
| -1.634500000000227 | 0.44 | -0.095 | -0.017 |
| -1.631000000000227 | 0.435 | -0.094 | -0.017 |
| -1.627500000000227 | 0.43 | -0.094 | -0.017 |
| -1.624000000000227 | 0.426 | -0.093 | -0.017 |
| -1.620500000000227 | 0.421 | -0.092 | -0.017 |
| -1.617000000000227 | 0.417 | -0.091 | -0.017 |
| -1.613500000000227 | 0.412 | -0.09 | -0.017 |
| -1.610000000000227 | 0.408 | -0.089 | -0.017 |
| -1.606500000000227 | 0.403 | -0.089 | -0.017 |
| -1.603000000000227 | 0.399 | -0.088 | -0.017 |
| -1.599500000000227 | 0.395 | -0.087 | -0.017 |
| -1.596000000000227 | 0.39 | -0.086 | -0.017 |
| -1.592500000000226 | 0.386 | -0.086 | -0.017 |
| -1.589000000000226 | 0.382 | -0.085 | -0.016 |
| -1.585500000000226 | 0.378 | -0.084 | -0.016 |
| -1.582000000000226 | 0.373 | -0.083 | -0.016 |
| -1.578500000000226 | 0.369 | -0.083 | -0.016 |
| -1.575000000000226 | 0.365 | -0.082 | -0.016 |
| -1.571500000000226 | 0.361 | -0.081 | -0.016 |
| -1.568000000000226 | 0.357 | -0.081 | -0.016 |
| -1.564500000000226 | 0.353 | -0.08 | -0.016 |
| -1.561000000000226 | 0.349 | -0.079 | -0.016 |
| -1.557500000000226 | 0.345 | -0.079 | -0.016 |
| -1.554000000000226 | 0.341 | -0.078 | -0.016 |
| -1.550500000000226 | 0.337 | -0.077 | -0.016 |
| -1.547000000000226 | 0.333 | -0.077 | -0.016 |
| -1.543500000000226 | 0.329 | -0.076 | -0.016 |
| -1.540000000000226 | 0.325 | -0.075 | -0.016 |
| -1.536500000000226 | 0.321 | -0.075 | -0.016 |
| -1.533000000000226 | 0.317 | -0.074 | -0.015 |
| -1.529500000000225 | 0.313 | -0.074 | -0.015 |
| -1.526000000000225 | 0.309 | -0.073 | -0.015 |
| -1.522500000000225 | 0.305 | -0.072 | -0.015 |
| -1.519000000000225 | 0.302 | -0.072 | -0.015 |
| -1.515500000000225 | 0.298 | -0.071 | -0.015 |
| -1.512000000000225 | 0.294 | -0.071 | -0.015 |
| -1.508500000000225 | 0.29 | -0.07 | -0.015 |
| -1.505000000000225 | 0.286 | -0.07 | -0.015 |
| -1.501500000000225 | 0.283 | -0.069 | -0.015 |
| -1.498000000000225 | 0.279 | -0.069 | -0.015 |
| -1.494500000000225 | 0.275 | -0.068 | -0.015 |
| -1.491000000000225 | 0.272 | -0.068 | -0.015 |
| -1.487500000000225 | 0.268 | -0.067 | -0.015 |
| -1.484000000000225 | 0.264 | -0.067 | -0.015 |
| -1.480500000000225 | 0.26 | -0.066 | -0.015 |
| -1.477000000000225 | 0.257 | -0.066 | -0.014 |
| -1.473500000000224 | 0.253 | -0.065 | -0.014 |
| -1.470000000000224 | 0.25 | -0.065 | -0.014 |
| -1.466500000000224 | 0.246 | -0.064 | -0.014 |
| -1.463000000000224 | 0.242 | -0.064 | -0.014 |
| -1.459500000000224 | 0.239 | -0.063 | -0.014 |
| -1.456000000000224 | 0.235 | -0.063 | -0.014 |
| -1.452500000000224 | 0.232 | -0.062 | -0.014 |
| -1.449000000000224 | 0.228 | -0.062 | -0.014 |
| -1.445500000000224 | 0.224 | -0.061 | -0.014 |
| -1.442000000000224 | 0.221 | -0.061 | -0.014 |
| -1.438500000000224 | 0.217 | -0.06 | -0.014 |
| -1.435000000000224 | 0.214 | -0.06 | -0.014 |
| -1.431500000000224 | 0.21 | -0.06 | -0.014 |
| -1.428000000000224 | 0.207 | -0.059 | -0.014 |
| -1.424500000000224 | 0.203 | -0.059 | -0.014 |
| -1.421000000000224 | 0.2 | -0.058 | -0.014 |
| -1.417500000000224 | 0.196 | -0.058 | -0.014 |
| -1.414000000000223 | 0.192 | -0.057 | -0.014 |
| -1.410500000000223 | 0.189 | -0.057 | -0.013 |
| -1.407000000000223 | 0.185 | -0.057 | -0.013 |
| -1.403500000000223 | 0.182 | -0.056 | -0.013 |
| -1.400000000000223 | 0.178 | -0.056 | -0.013 |
| -1.396500000000223 | 0.175 | -0.055 | -0.013 |
| -1.393000000000223 | 0.171 | -0.055 | -0.013 |
| -1.389500000000223 | 0.168 | -0.055 | -0.013 |
| -1.386000000000223 | 0.164 | -0.054 | -0.013 |
| -1.382500000000223 | 0.161 | -0.054 | -0.013 |
| -1.379000000000223 | 0.157 | -0.054 | -0.013 |
| -1.375500000000223 | 0.154 | -0.053 | -0.013 |
| -1.372000000000223 | 0.15 | -0.053 | -0.013 |
| -1.368500000000223 | 0.147 | -0.053 | -0.013 |
| -1.365000000000223 | 0.143 | -0.052 | -0.013 |
| -1.361500000000223 | 0.14 | -0.052 | -0.013 |
| -1.358000000000223 | 0.136 | -0.051 | -0.013 |
| -1.354500000000222 | 0.133 | -0.051 | -0.013 |
| -1.351000000000222 | 0.129 | -0.051 | -0.013 |
| -1.347500000000222 | 0.126 | -0.05 | -0.013 |
| -1.344000000000222 | 0.122 | -0.05 | -0.013 |
| -1.340500000000222 | 0.119 | -0.05 | -0.012 |
| -1.337000000000222 | 0.115 | -0.049 | -0.012 |
| -1.333500000000222 | 0.112 | -0.049 | -0.012 |
| -1.330000000000222 | 0.108 | -0.049 | -0.012 |
| -1.326500000000222 | 0.105 | -0.048 | -0.012 |
| -1.323000000000222 | 0.101 | -0.048 | -0.012 |
| -1.319500000000222 | 0.098 | -0.048 | -0.012 |
| -1.316000000000222 | 0.094 | -0.048 | -0.012 |
| -1.312500000000222 | 0.09 | -0.047 | -0.012 |
| -1.309000000000222 | 0.087 | -0.047 | -0.012 |
| -1.305500000000222 | 0.083 | -0.047 | -0.012 |
| -1.302000000000222 | 0.08 | -0.046 | -0.012 |
| -1.298500000000222 | 0.076 | -0.046 | -0.012 |
| -1.295000000000221 | 0.072 | -0.046 | -0.012 |
| -1.291500000000221 | 0.069 | -0.045 | -0.012 |
| -1.288000000000221 | 0.065 | -0.045 | -0.012 |
| -1.284500000000221 | 0.061 | -0.045 | -0.012 |
| -1.281000000000221 | 0.058 | -0.045 | -0.012 |
| -1.277500000000221 | 0.054 | -0.044 | -0.012 |
| -1.274000000000221 | 0.05 | -0.044 | -0.012 |
| -1.270500000000221 | 0.046 | -0.044 | -0.012 |
| -1.267000000000221 | 0.043 | -0.044 | -0.012 |
| -1.263500000000221 | 0.039 | -0.043 | -0.012 |
| -1.260000000000221 | 0.035 | -0.043 | -0.011 |
| -1.256500000000221 | 0.031 | -0.043 | -0.011 |
| -1.253000000000221 | 0.027 | -0.042 | -0.011 |
| -1.249500000000221 | 0.023 | -0.042 | -0.011 |
| -1.246000000000221 | 0.02 | -0.042 | -0.011 |
| -1.242500000000221 | 0.016 | -0.042 | -0.011 |
| -1.239000000000221 | 0.012 | -0.041 | -0.011 |
| -1.235500000000221 | 0.008 | -0.041 | -0.011 |
| -1.23200000000022 | 0.004 | -0.041 | -0.011 |
| -1.22850000000022 | 0 | -0.041 | -0.011 |
| -1.22500000000022 | -0.004 | -0.04 | -0.011 |
| -1.22150000000022 | -0.008 | -0.04 | -0.011 |
| -1.21800000000022 | -0.013 | -0.04 | -0.011 |
| -1.21450000000022 | -0.017 | -0.04 | -0.011 |
| -1.21100000000022 | -0.021 | -0.04 | -0.011 |
| -1.20750000000022 | -0.025 | -0.039 | -0.011 |
| -1.20400000000022 | -0.029 | -0.039 | -0.011 |
| -1.20050000000022 | -0.034 | -0.039 | -0.011 |
| -1.19700000000022 | -0.038 | -0.039 | -0.011 |
| -1.19350000000022 | -0.043 | -0.038 | -0.011 |
| -1.19000000000022 | -0.047 | -0.038 | -0.011 |
| -1.18650000000022 | -0.051 | -0.038 | -0.011 |
| -1.18300000000022 | -0.056 | -0.038 | -0.011 |
| -1.17950000000022 | -0.061 | -0.037 | -0.011 |
| -1.17600000000022 | -0.065 | -0.037 | -0.011 |
| -1.172500000000219 | -0.07 | -0.037 | -0.01 |
| -1.169000000000219 | -0.075 | -0.037 | -0.01 |
| -1.165500000000219 | -0.08 | -0.037 | -0.01 |
| -1.16200000000022 | -0.085 | -0.036 | -0.01 |
| -1.15850000000022 | -0.089 | -0.036 | -0.01 |
| -1.15500000000022 | -0.095 | -0.036 | -0.01 |
| -1.15150000000022 | -0.1 | -0.036 | -0.01 |
| -1.14800000000022 | -0.105 | -0.036 | -0.01 |
| -1.144500000000219 | -0.11 | -0.035 | -0.01 |
| -1.141000000000219 | -0.116 | -0.035 | -0.01 |
| -1.137500000000219 | -0.121 | -0.035 | -0.01 |
| -1.134000000000219 | -0.127 | -0.035 | -0.01 |
| -1.130500000000219 | -0.132 | -0.035 | -0.01 |
| -1.127000000000219 | -0.138 | -0.034 | -0.01 |
| -1.123500000000219 | -0.144 | -0.034 | -0.01 |
| -1.120000000000219 | -0.15 | -0.034 | -0.01 |
| -1.116500000000219 | -0.156 | -0.034 | -0.01 |
| -1.113000000000218 | -0.163 | -0.034 | -0.01 |
| -1.109500000000218 | -0.169 | -0.033 | -0.01 |
| -1.106000000000218 | -0.176 | -0.033 | -0.01 |
| -1.102500000000218 | -0.183 | -0.033 | -0.01 |
| -1.099000000000218 | -0.19 | -0.033 | -0.01 |
| -1.095500000000218 | -0.197 | -0.033 | -0.01 |
| -1.092000000000218 | -0.204 | -0.033 | -0.01 |
| -1.088500000000218 | -0.212 | -0.032 | -0.01 |
| -1.085000000000218 | -0.22 | -0.032 | -0.01 |
| -1.081500000000218 | -0.228 | -0.032 | -0.01 |
| -1.078000000000218 | -0.237 | -0.032 | -0.01 |
| -1.074500000000218 | -0.245 | -0.032 | -0.01 |
| -1.071000000000218 | -0.255 | -0.032 | -0.009 |
| -1.067500000000218 | -0.264 | -0.031 | -0.009 |
| -1.064000000000218 | -0.274 | -0.031 | -0.009 |
| -1.060500000000218 | -0.285 | -0.031 | -0.009 |
| -1.057000000000218 | -0.296 | -0.031 | -0.009 |
| -1.053500000000217 | -0.308 | -0.031 | -0.009 |
| -1.050000000000217 | -0.32 | -0.031 | -0.009 |
| -1.046500000000217 | -0.333 | -0.03 | -0.009 |
| -1.043000000000217 | -0.347 | -0.03 | -0.009 |
| -1.039500000000217 | -0.363 | -0.03 | -0.009 |
| -1.036000000000217 | -0.379 | -0.03 | -0.009 |
| -1.032500000000217 | -0.397 | -0.03 | -0.009 |
| -1.029000000000217 | -0.418 | -0.03 | -0.009 |
| -1.025500000000217 | -0.44 | -0.029 | -0.009 |
| -1.022000000000217 | -0.466 | -0.029 | -0.009 |
| -1.018500000000217 | -0.496 | -0.029 | -0.009 |
| -1.015000000000217 | -0.532 | -0.029 | -0.009 |
| -1.011500000000217 | -0.577 | -0.029 | -0.009 |
| -1.008000000000217 | -0.639 | -0.029 | -0.009 |
| -1.004500000000217 | -0.736 | -0.029 | -0.009 |
| -1.001000000000217 | -10 | -0.028 | -0.009 |
| -0.997500000000217 | -0.836 | -0.028 | -0.009 |
| -0.994000000000217 | -0.691 | -0.028 | -0.009 |
| -0.990500000000217 | -0.615 | -0.028 | -0.009 |
| -0.987000000000217 | -0.564 | -0.028 | -0.009 |
| -0.983500000000217 | -0.526 | -0.028 | -0.009 |
| -0.980000000000217 | -0.495 | -0.028 | -0.009 |
| -0.976500000000217 | -0.469 | -0.027 | -0.009 |
| -0.973000000000217 | -0.447 | -0.027 | -0.009 |
| -0.969500000000217 | -0.427 | -0.027 | -0.009 |
| -0.966000000000217 | -0.41 | -0.027 | -0.009 |
| -0.962500000000217 | -0.395 | -0.027 | -0.009 |
| -0.959000000000217 | -0.381 | -0.027 | -0.009 |
| -0.955500000000217 | -0.368 | -0.027 | -0.009 |
| -0.952000000000217 | -0.357 | -0.026 | -0.008 |
| -0.948500000000217 | -0.346 | -0.026 | -0.008 |
| -0.945000000000217 | -0.336 | -0.026 | -0.008 |
| -0.941500000000217 | -0.327 | -0.026 | -0.008 |
| -0.938000000000218 | -0.318 | -0.026 | -0.008 |
| -0.934500000000218 | -0.31 | -0.026 | -0.008 |
| -0.931000000000218 | -0.302 | -0.026 | -0.008 |
| -0.927500000000218 | -0.295 | -0.026 | -0.008 |
| -0.924000000000218 | -0.288 | -0.025 | -0.008 |
| -0.920500000000218 | -0.282 | -0.025 | -0.008 |
| -0.917000000000218 | -0.275 | -0.025 | -0.008 |
| -0.913500000000218 | -0.27 | -0.025 | -0.008 |
| -0.910000000000218 | -0.264 | -0.025 | -0.008 |
| -0.906500000000218 | -0.258 | -0.025 | -0.008 |
| -0.903000000000218 | -0.253 | -0.025 | -0.008 |
| -0.899500000000218 | -0.248 | -0.025 | -0.008 |
| -0.896000000000218 | -0.244 | -0.024 | -0.008 |
| -0.892500000000218 | -0.239 | -0.024 | -0.008 |
| -0.889000000000218 | -0.235 | -0.024 | -0.008 |
| -0.885500000000218 | -0.23 | -0.024 | -0.008 |
| -0.882000000000218 | -0.226 | -0.024 | -0.008 |
| -0.878500000000218 | -0.222 | -0.024 | -0.008 |
| -0.875000000000218 | -0.218 | -0.024 | -0.008 |
| -0.871500000000218 | -0.215 | -0.024 | -0.008 |
| -0.868000000000219 | -0.211 | -0.023 | -0.008 |
| -0.864500000000219 | -0.208 | -0.023 | -0.008 |
| -0.861000000000219 | -0.204 | -0.023 | -0.008 |
| -0.857500000000219 | -0.201 | -0.023 | -0.008 |
| -0.854000000000219 | -0.198 | -0.023 | -0.008 |
| -0.850500000000219 | -0.195 | -0.023 | -0.008 |
| -0.847000000000219 | -0.192 | -0.023 | -0.008 |
| -0.843500000000219 | -0.189 | -0.023 | -0.008 |
| -0.840000000000219 | -0.186 | -0.023 | -0.008 |
| -0.836500000000219 | -0.184 | -0.023 | -0.008 |
| -0.833000000000219 | -0.181 | -0.022 | -0.008 |
| -0.829500000000219 | -0.178 | -0.022 | -0.008 |
| -0.826000000000219 | -0.176 | -0.022 | -0.008 |
| -0.822500000000219 | -0.173 | -0.022 | -0.008 |
| -0.819000000000219 | -0.171 | -0.022 | -0.008 |
| -0.815500000000219 | -0.169 | -0.022 | -0.008 |
| -0.812000000000219 | -0.166 | -0.022 | -0.007 |
| -0.808500000000219 | -0.164 | -0.022 | -0.007 |
| -0.805000000000219 | -0.162 | -0.022 | -0.007 |
| -0.80150000000022 | -0.16 | -0.021 | -0.007 |
| -0.79800000000022 | -0.158 | -0.021 | -0.007 |
| -0.79450000000022 | -0.156 | -0.021 | -0.007 |
| -0.79100000000022 | -0.154 | -0.021 | -0.007 |
| -0.78750000000022 | -0.152 | -0.021 | -0.007 |
| -0.78400000000022 | -0.15 | -0.021 | -0.007 |
| -0.78050000000022 | -0.148 | -0.021 | -0.007 |
| -0.77700000000022 | -0.146 | -0.021 | -0.007 |
| -0.77350000000022 | -0.145 | -0.021 | -0.007 |
| -0.77000000000022 | -0.143 | -0.021 | -0.007 |
| -0.76650000000022 | -0.141 | -0.021 | -0.007 |
| -0.76300000000022 | -0.14 | -0.02 | -0.007 |
| -0.75950000000022 | -0.138 | -0.02 | -0.007 |
| -0.75600000000022 | -0.136 | -0.02 | -0.007 |
| -0.75250000000022 | -0.135 | -0.02 | -0.007 |
| -0.74900000000022 | -0.133 | -0.02 | -0.007 |
| -0.74550000000022 | -0.132 | -0.02 | -0.007 |
| -0.74200000000022 | -0.13 | -0.02 | -0.007 |
| -0.73850000000022 | -0.129 | -0.02 | -0.007 |
| -0.735000000000221 | -0.127 | -0.02 | -0.007 |
| -0.731500000000221 | -0.126 | -0.02 | -0.007 |
| -0.728000000000221 | -0.125 | -0.02 | -0.007 |
| -0.724500000000221 | -0.123 | -0.019 | -0.007 |
| -0.721000000000221 | -0.122 | -0.019 | -0.007 |
| -0.717500000000221 | -0.121 | -0.019 | -0.007 |
| -0.714000000000221 | -0.119 | -0.019 | -0.007 |
| -0.710500000000221 | -0.118 | -0.019 | -0.007 |
| -0.707000000000221 | -0.117 | -0.019 | -0.007 |
| -0.703500000000221 | -0.116 | -0.019 | -0.007 |
| -0.700000000000221 | -0.114 | -0.019 | -0.007 |
| -0.696500000000221 | -0.113 | -0.019 | -0.007 |
| -0.693000000000221 | -0.112 | -0.019 | -0.007 |
| -0.689500000000221 | -0.111 | -0.019 | -0.007 |
| -0.686000000000221 | -0.11 | -0.019 | -0.007 |
| -0.682500000000221 | -0.109 | -0.018 | -0.007 |
| -0.679000000000221 | -0.108 | -0.018 | -0.007 |
| -0.675500000000221 | -0.107 | -0.018 | -0.007 |
| -0.672000000000221 | -0.106 | -0.018 | -0.007 |
| -0.668500000000221 | -0.104 | -0.018 | -0.007 |
| -0.665000000000222 | -0.103 | -0.018 | -0.007 |
| -0.661500000000222 | -0.102 | -0.018 | -0.007 |
| -0.658000000000222 | -0.101 | -0.018 | -0.007 |
| -0.654500000000222 | -0.101 | -0.018 | -0.007 |
| -0.651000000000222 | -0.1 | -0.018 | -0.007 |
| -0.647500000000222 | -0.099 | -0.018 | -0.006 |
| -0.644000000000222 | -0.098 | -0.018 | -0.006 |
| -0.640500000000222 | -0.097 | -0.018 | -0.006 |
| -0.637000000000222 | -0.096 | -0.017 | -0.006 |
| -0.633500000000222 | -0.095 | -0.017 | -0.006 |
| -0.630000000000222 | -0.094 | -0.017 | -0.006 |
| -0.626500000000222 | -0.093 | -0.017 | -0.006 |
| -0.623000000000222 | -0.092 | -0.017 | -0.006 |
| -0.619500000000222 | -0.092 | -0.017 | -0.006 |
| -0.616000000000222 | -0.091 | -0.017 | -0.006 |
| -0.612500000000222 | -0.09 | -0.017 | -0.006 |
| -0.609000000000222 | -0.089 | -0.017 | -0.006 |
| -0.605500000000222 | -0.088 | -0.017 | -0.006 |
| -0.602000000000222 | -0.088 | -0.017 | -0.006 |
| -0.598500000000223 | -0.087 | -0.017 | -0.006 |
| -0.595000000000223 | -0.086 | -0.017 | -0.006 |
| -0.591500000000223 | -0.085 | -0.017 | -0.006 |
| -0.588000000000223 | -0.085 | -0.016 | -0.006 |
| -0.584500000000223 | -0.084 | -0.016 | -0.006 |
| -0.581000000000223 | -0.083 | -0.016 | -0.006 |
| -0.577500000000223 | -0.082 | -0.016 | -0.006 |
| -0.574000000000223 | -0.082 | -0.016 | -0.006 |
| -0.570500000000223 | -0.081 | -0.016 | -0.006 |
| -0.567000000000223 | -0.08 | -0.016 | -0.006 |
| -0.563500000000223 | -0.08 | -0.016 | -0.006 |
| -0.560000000000223 | -0.079 | -0.016 | -0.006 |
| -0.556500000000223 | -0.078 | -0.016 | -0.006 |
| -0.553000000000223 | -0.078 | -0.016 | -0.006 |
| -0.549500000000223 | -0.077 | -0.016 | -0.006 |
| -0.546000000000223 | -0.076 | -0.016 | -0.006 |
| -0.542500000000223 | -0.076 | -0.016 | -0.006 |
| -0.539000000000224 | -0.075 | -0.016 | -0.006 |
| -0.535500000000224 | -0.075 | -0.015 | -0.006 |
| -0.532000000000224 | -0.074 | -0.015 | -0.006 |
| -0.528500000000224 | -0.073 | -0.015 | -0.006 |
| -0.525000000000224 | -0.073 | -0.015 | -0.006 |
| -0.521500000000224 | -0.072 | -0.015 | -0.006 |
| -0.518000000000224 | -0.072 | -0.015 | -0.006 |
| -0.514500000000224 | -0.071 | -0.015 | -0.006 |
| -0.511000000000224 | -0.071 | -0.015 | -0.006 |
| -0.507500000000224 | -0.07 | -0.015 | -0.006 |
| -0.504000000000224 | -0.07 | -0.015 | -0.006 |
| -0.500500000000224 | -0.069 | -0.015 | -0.006 |
| -0.497000000000224 | -0.068 | -0.015 | -0.006 |
| -0.493500000000224 | -0.068 | -0.015 | -0.006 |
| -0.490000000000224 | -0.067 | -0.015 | -0.006 |
| -0.486500000000224 | -0.067 | -0.015 | -0.006 |
| -0.483000000000224 | -0.066 | -0.015 | -0.006 |
| -0.479500000000224 | -0.066 | -0.015 | -0.006 |
| -0.476000000000224 | -0.065 | -0.014 | -0.006 |
| -0.472500000000224 | -0.065 | -0.014 | -0.006 |
| -0.469000000000224 | -0.064 | -0.014 | -0.006 |
| -0.465500000000224 | -0.064 | -0.014 | -0.006 |
| -0.462000000000224 | -0.063 | -0.014 | -0.006 |
| -0.458500000000224 | -0.063 | -0.014 | -0.006 |
| -0.455000000000224 | -0.063 | -0.014 | -0.006 |
| -0.451500000000224 | -0.062 | -0.014 | -0.006 |
| -0.448000000000224 | -0.062 | -0.014 | -0.006 |
| -0.444500000000224 | -0.061 | -0.014 | -0.006 |
| -0.441000000000224 | -0.061 | -0.014 | -0.005 |
| -0.437500000000224 | -0.06 | -0.014 | -0.005 |
| -0.434000000000224 | -0.06 | -0.014 | -0.005 |
| -0.430500000000224 | -0.059 | -0.014 | -0.005 |
| -0.427000000000224 | -0.059 | -0.014 | -0.005 |
| -0.423500000000224 | -0.059 | -0.014 | -0.005 |
| -0.420000000000224 | -0.058 | -0.014 | -0.005 |
| -0.416500000000224 | -0.058 | -0.014 | -0.005 |
| -0.413000000000224 | -0.057 | -0.013 | -0.005 |
| -0.409500000000224 | -0.057 | -0.013 | -0.005 |
| -0.406000000000224 | -0.057 | -0.013 | -0.005 |
| -0.402500000000224 | -0.056 | -0.013 | -0.005 |
| -0.399000000000224 | -0.056 | -0.013 | -0.005 |
| -0.395500000000224 | -0.055 | -0.013 | -0.005 |
| -0.392000000000224 | -0.055 | -0.013 | -0.005 |
| -0.388500000000224 | -0.055 | -0.013 | -0.005 |
| -0.385000000000224 | -0.054 | -0.013 | -0.005 |
| -0.381500000000224 | -0.054 | -0.013 | -0.005 |
| -0.378000000000224 | -0.054 | -0.013 | -0.005 |
| -0.374500000000224 | -0.053 | -0.013 | -0.005 |
| -0.371000000000224 | -0.053 | -0.013 | -0.005 |
| -0.367500000000224 | -0.052 | -0.013 | -0.005 |
| -0.364000000000224 | -0.052 | -0.013 | -0.005 |
| -0.360500000000224 | -0.052 | -0.013 | -0.005 |
| -0.357000000000224 | -0.051 | -0.013 | -0.005 |
| -0.353500000000224 | -0.051 | -0.013 | -0.005 |
| -0.350000000000224 | -0.051 | -0.013 | -0.005 |
| -0.346500000000224 | -0.05 | -0.013 | -0.005 |
| -0.343000000000224 | -0.05 | -0.013 | -0.005 |
| -0.339500000000224 | -0.05 | -0.012 | -0.005 |
| -0.336000000000224 | -0.049 | -0.012 | -0.005 |
| -0.332500000000224 | -0.049 | -0.012 | -0.005 |
| -0.329000000000224 | -0.049 | -0.012 | -0.005 |
| -0.325500000000224 | -0.048 | -0.012 | -0.005 |
| -0.322000000000224 | -0.048 | -0.012 | -0.005 |
| -0.318500000000224 | -0.048 | -0.012 | -0.005 |
| -0.315000000000224 | -0.047 | -0.012 | -0.005 |
| -0.311500000000224 | -0.047 | -0.012 | -0.005 |
| -0.308000000000224 | -0.047 | -0.012 | -0.005 |
| -0.304500000000224 | -0.047 | -0.012 | -0.005 |
| -0.301000000000224 | -0.046 | -0.012 | -0.005 |
| -0.297500000000224 | -0.046 | -0.012 | -0.005 |
| -0.294000000000224 | -0.046 | -0.012 | -0.005 |
| -0.290500000000224 | -0.045 | -0.012 | -0.005 |
| -0.287000000000224 | -0.045 | -0.012 | -0.005 |
| -0.283500000000224 | -0.045 | -0.012 | -0.005 |
| -0.280000000000224 | -0.045 | -0.012 | -0.005 |
| -0.276500000000224 | -0.044 | -0.012 | -0.005 |
| -0.273000000000224 | -0.044 | -0.012 | -0.005 |
| -0.269500000000224 | -0.044 | -0.012 | -0.005 |
| -0.266000000000224 | -0.043 | -0.012 | -0.005 |
| -0.262500000000224 | -0.043 | -0.011 | -0.005 |
| -0.259000000000224 | -0.043 | -0.011 | -0.005 |
| -0.255500000000224 | -0.043 | -0.011 | -0.005 |
| -0.252000000000224 | -0.042 | -0.011 | -0.005 |
| -0.248500000000224 | -0.042 | -0.011 | -0.005 |
| -0.245000000000224 | -0.042 | -0.011 | -0.005 |
| -0.241500000000224 | -0.042 | -0.011 | -0.005 |
| -0.238000000000224 | -0.041 | -0.011 | -0.005 |
| -0.234500000000224 | -0.041 | -0.011 | -0.005 |
| -0.231000000000224 | -0.041 | -0.011 | -0.005 |
| -0.227500000000224 | -0.041 | -0.011 | -0.005 |
| -0.224000000000224 | -0.04 | -0.011 | -0.005 |
| -0.220500000000224 | -0.04 | -0.011 | -0.005 |
| -0.217000000000224 | -0.04 | -0.011 | -0.005 |
| -0.213500000000224 | -0.04 | -0.011 | -0.005 |
| -0.210000000000224 | -0.039 | -0.011 | -0.005 |
| -0.206500000000224 | -0.039 | -0.011 | -0.005 |
| -0.203000000000224 | -0.039 | -0.011 | -0.005 |
| -0.199500000000224 | -0.039 | -0.011 | -0.005 |
| -0.196000000000224 | -0.039 | -0.011 | -0.005 |
| -0.192500000000224 | -0.038 | -0.011 | -0.005 |
| -0.189000000000224 | -0.038 | -0.011 | -0.005 |
| -0.185500000000224 | -0.038 | -0.011 | -0.005 |
| -0.182000000000224 | -0.038 | -0.011 | -0.005 |
| -0.178500000000224 | -0.037 | -0.011 | -0.004 |
| -0.175000000000224 | -0.037 | -0.011 | -0.004 |
| -0.171500000000224 | -0.037 | -0.01 | -0.004 |
| -0.168000000000224 | -0.037 | -0.01 | -0.004 |
| -0.164500000000224 | -0.037 | -0.01 | -0.004 |
| -0.161000000000224 | -0.036 | -0.01 | -0.004 |
| -0.157500000000224 | -0.036 | -0.01 | -0.004 |
| -0.154000000000224 | -0.036 | -0.01 | -0.004 |
| -0.150500000000224 | -0.036 | -0.01 | -0.004 |
| -0.147000000000224 | -0.036 | -0.01 | -0.004 |
| -0.143500000000224 | -0.035 | -0.01 | -0.004 |
| -0.140000000000224 | -0.035 | -0.01 | -0.004 |
| -0.136500000000224 | -0.035 | -0.01 | -0.004 |
| -0.133000000000224 | -0.035 | -0.01 | -0.004 |
| -0.129500000000224 | -0.035 | -0.01 | -0.004 |
| -0.126000000000224 | -0.034 | -0.01 | -0.004 |
| -0.122500000000224 | -0.034 | -0.01 | -0.004 |
| -0.119000000000224 | -0.034 | -0.01 | -0.004 |
| -0.115500000000224 | -0.034 | -0.01 | -0.004 |
| -0.112000000000224 | -0.034 | -0.01 | -0.004 |
| -0.108500000000224 | -0.033 | -0.01 | -0.004 |
| -0.105000000000224 | -0.033 | -0.01 | -0.004 |
| -0.101500000000224 | -0.033 | -0.01 | -0.004 |
| -0.0980000000002237 | -0.033 | -0.01 | -0.004 |
| -0.0945000000002237 | -0.033 | -0.01 | -0.004 |
| -0.0910000000002237 | -0.033 | -0.01 | -0.004 |
| -0.0875000000002237 | -0.032 | -0.01 | -0.004 |
| -0.0840000000002237 | -0.032 | -0.01 | -0.004 |
| -0.0805000000002237 | -0.032 | -0.01 | -0.004 |
| -0.0770000000002237 | -0.032 | -0.01 | -0.004 |
| -0.0735000000002237 | -0.032 | -0.01 | -0.004 |
| -0.0700000000002237 | -0.031 | -0.009 | -0.004 |
| -0.0665000000002237 | -0.031 | -0.009 | -0.004 |
| -0.0630000000002237 | -0.031 | -0.009 | -0.004 |
| -0.0595000000002237 | -0.031 | -0.009 | -0.004 |
| -0.0560000000002237 | -0.031 | -0.009 | -0.004 |
| -0.0525000000002237 | -0.031 | -0.009 | -0.004 |
| -0.0490000000002237 | -0.03 | -0.009 | -0.004 |
| -0.0455000000002237 | -0.03 | -0.009 | -0.004 |
| -0.0420000000002237 | -0.03 | -0.009 | -0.004 |
| -0.0385000000002237 | -0.03 | -0.009 | -0.004 |
| -0.0350000000002237 | -0.03 | -0.009 | -0.004 |
| -0.0315000000002237 | -0.03 | -0.009 | -0.004 |
| -0.0280000000002237 | -0.03 | -0.009 | -0.004 |
| -0.0245000000002237 | -0.029 | -0.009 | -0.004 |
| -0.0210000000002237 | -0.029 | -0.009 | -0.004 |
| -0.0175000000002237 | -0.029 | -0.009 | -0.004 |
| -0.0140000000002237 | -0.029 | -0.009 | -0.004 |
| -0.0105000000002237 | -0.029 | -0.009 | -0.004 |
| -0.00700000000022368 | -0.029 | -0.009 | -0.004 |
| -0.00350000000022368 | -0.028 | -0.009 | -0.004 |
| -2.23684785971567e-13 | -0.028 | -0.009 | -0.004 |